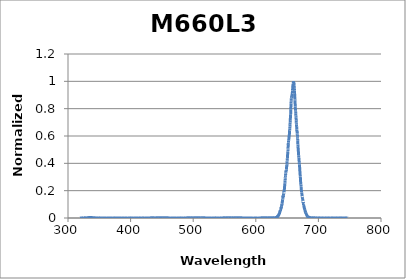
| Category | Normalized Intensity |
|---|---|
| 319.06123499 | 0 |
| 319.17558872 | 0 |
| 319.28993869 | 0 |
| 319.40428493 | 0 |
| 319.51862744 | 0 |
| 319.63296621 | 0 |
| 319.74730126 | 0.001 |
| 319.86163259 | 0 |
| 319.9759602 | 0 |
| 320.09028409 | 0 |
| 320.20460428 | 0 |
| 320.31892077 | 0 |
| 320.43323355 | 0 |
| 320.54754264 | 0 |
| 320.66184804 | 0.001 |
| 320.77614975 | 0 |
| 320.89044778 | 0 |
| 321.00474213 | 0 |
| 321.11903281 | 0 |
| 321.23331982 | 0 |
| 321.34760317 | 0 |
| 321.46188285 | 0 |
| 321.57615889 | 0.001 |
| 321.69043127 | 0 |
| 321.8047 | 0 |
| 321.91896509 | 0 |
| 322.03322655 | 0 |
| 322.14748437 | 0 |
| 322.26173856 | 0 |
| 322.37598913 | 0 |
| 322.49023607 | 0 |
| 322.60447941 | 0 |
| 322.71871913 | 0 |
| 322.83295524 | 0 |
| 322.94718775 | 0 |
| 323.06141667 | 0 |
| 323.17564199 | 0 |
| 323.28986372 | 0 |
| 323.40408187 | 0 |
| 323.51829644 | 0.001 |
| 323.63250743 | 0.001 |
| 323.74671485 | 0 |
| 323.8609187 | 0 |
| 323.97511899 | 0 |
| 324.08931573 | 0 |
| 324.20350891 | 0 |
| 324.31769854 | 0 |
| 324.43188462 | 0 |
| 324.54606717 | 0 |
| 324.66024618 | 0 |
| 324.77442166 | 0 |
| 324.88859361 | 0 |
| 325.00276204 | 0 |
| 325.11692695 | 0 |
| 325.23108834 | 0.001 |
| 325.34524623 | 0 |
| 325.45940061 | 0 |
| 325.5735515 | 0 |
| 325.68769888 | 0 |
| 325.80184278 | 0 |
| 325.91598318 | 0 |
| 326.03012011 | 0.001 |
| 326.14425355 | 0.001 |
| 326.25838353 | 0 |
| 326.37251003 | 0 |
| 326.48663307 | 0 |
| 326.60075264 | 0 |
| 326.71486877 | 0.001 |
| 326.82898144 | 0.001 |
| 326.94309066 | 0 |
| 327.05719644 | 0 |
| 327.17129878 | 0 |
| 327.28539768 | 0 |
| 327.39949316 | 0.001 |
| 327.51358521 | 0 |
| 327.62767384 | 0.001 |
| 327.74175906 | 0 |
| 327.85584086 | 0 |
| 327.96991926 | 0 |
| 328.08399425 | 0.001 |
| 328.19806584 | 0.001 |
| 328.31213404 | 0 |
| 328.42619885 | 0.001 |
| 328.54026028 | 0 |
| 328.65431832 | 0.001 |
| 328.76837299 | 0 |
| 328.88242428 | 0 |
| 328.99647221 | 0.001 |
| 329.11051677 | 0 |
| 329.22455798 | 0 |
| 329.33859583 | 0 |
| 329.45263033 | 0 |
| 329.56666148 | 0 |
| 329.6806893 | 0.001 |
| 329.79471377 | 0 |
| 329.90873492 | 0.001 |
| 330.02275274 | 0.001 |
| 330.13676723 | 0.001 |
| 330.2507784 | 0.002 |
| 330.36478626 | 0.001 |
| 330.47879081 | 0.001 |
| 330.59279206 | 0.002 |
| 330.70679 | 0.001 |
| 330.82078465 | 0 |
| 330.934776 | 0.002 |
| 331.04876407 | 0.001 |
| 331.16274885 | 0.001 |
| 331.27673036 | 0 |
| 331.39070858 | 0.002 |
| 331.50468354 | 0.001 |
| 331.61865523 | 0.001 |
| 331.73262367 | 0.001 |
| 331.84658884 | 0.002 |
| 331.96055076 | 0.001 |
| 332.07450943 | 0.002 |
| 332.18846486 | 0.001 |
| 332.30241705 | 0.002 |
| 332.41636601 | 0.002 |
| 332.53031174 | 0.003 |
| 332.64425423 | 0.002 |
| 332.75819351 | 0.004 |
| 332.87212957 | 0.002 |
| 332.98606242 | 0.003 |
| 333.09999206 | 0.003 |
| 333.21391849 | 0.004 |
| 333.32784173 | 0.004 |
| 333.44176177 | 0.004 |
| 333.55567862 | 0.002 |
| 333.66959229 | 0.003 |
| 333.78350277 | 0.004 |
| 333.89741007 | 0.003 |
| 334.0113142 | 0.002 |
| 334.12521517 | 0.004 |
| 334.23911297 | 0.003 |
| 334.35300761 | 0.004 |
| 334.46689909 | 0.002 |
| 334.58078743 | 0.003 |
| 334.69467261 | 0.003 |
| 334.80855466 | 0.003 |
| 334.92243357 | 0.003 |
| 335.03630934 | 0.003 |
| 335.15018199 | 0.002 |
| 335.26405151 | 0.003 |
| 335.37791791 | 0.003 |
| 335.4917812 | 0.003 |
| 335.60564138 | 0.003 |
| 335.71949845 | 0.003 |
| 335.83335241 | 0.004 |
| 335.94720328 | 0.003 |
| 336.06105106 | 0.002 |
| 336.17489575 | 0.003 |
| 336.28873735 | 0.003 |
| 336.40257588 | 0.004 |
| 336.51641132 | 0.003 |
| 336.6302437 | 0.004 |
| 336.74407301 | 0.003 |
| 336.85789926 | 0.004 |
| 336.97172245 | 0.001 |
| 337.08554259 | 0.003 |
| 337.19935967 | 0.004 |
| 337.31317372 | 0.003 |
| 337.42698472 | 0.001 |
| 337.54079269 | 0.002 |
| 337.65459762 | 0.002 |
| 337.76839953 | 0.003 |
| 337.88219842 | 0.001 |
| 337.99599429 | 0.002 |
| 338.10978714 | 0.002 |
| 338.22357699 | 0.002 |
| 338.33736383 | 0.001 |
| 338.45114767 | 0.002 |
| 338.56492852 | 0.001 |
| 338.67870637 | 0.003 |
| 338.79248124 | 0.001 |
| 338.90625312 | 0.001 |
| 339.02002203 | 0.002 |
| 339.13378796 | 0.001 |
| 339.24755093 | 0.001 |
| 339.36131093 | 0.002 |
| 339.47506796 | 0.001 |
| 339.58882205 | 0.002 |
| 339.70257318 | 0.002 |
| 339.81632136 | 0.002 |
| 339.9300666 | 0.001 |
| 340.0438089 | 0.001 |
| 340.15754827 | 0.001 |
| 340.27128471 | 0.001 |
| 340.38501822 | 0.001 |
| 340.49874882 | 0.001 |
| 340.61247649 | 0.002 |
| 340.72620126 | 0.002 |
| 340.83992312 | 0.002 |
| 340.95364207 | 0.001 |
| 341.06735813 | 0.001 |
| 341.18107129 | 0.001 |
| 341.29478156 | 0 |
| 341.40848895 | 0.002 |
| 341.52219346 | 0.001 |
| 341.63589509 | 0 |
| 341.74959385 | 0 |
| 341.86328974 | 0.001 |
| 341.97698277 | 0.001 |
| 342.09067293 | 0.001 |
| 342.20436025 | 0 |
| 342.31804472 | 0.001 |
| 342.43172634 | 0.001 |
| 342.54540511 | 0.001 |
| 342.65908106 | 0.001 |
| 342.77275417 | 0.001 |
| 342.88642445 | 0 |
| 343.00009191 | 0 |
| 343.11375655 | 0 |
| 343.22741838 | 0.001 |
| 343.34107739 | 0 |
| 343.45473361 | 0.001 |
| 343.56838701 | 0 |
| 343.68203763 | 0 |
| 343.79568545 | 0 |
| 343.90933048 | 0.001 |
| 344.02297273 | 0 |
| 344.1366122 | 0 |
| 344.2502489 | 0 |
| 344.36388283 | 0 |
| 344.47751399 | 0 |
| 344.59114238 | 0 |
| 344.70476803 | 0.001 |
| 344.81839092 | 0.001 |
| 344.93201106 | 0 |
| 345.04562846 | 0.001 |
| 345.15924312 | 0 |
| 345.27285504 | 0 |
| 345.38646424 | 0 |
| 345.5000707 | 0 |
| 345.61367445 | 0 |
| 345.72727548 | 0 |
| 345.8408738 | 0.001 |
| 345.95446941 | 0 |
| 346.06806231 | 0.001 |
| 346.18165252 | 0 |
| 346.29524003 | 0 |
| 346.40882485 | 0.001 |
| 346.52240699 | 0 |
| 346.63598644 | 0 |
| 346.74956322 | 0 |
| 346.86313732 | 0 |
| 346.97670876 | 0 |
| 347.09027753 | 0 |
| 347.20384364 | 0 |
| 347.31740709 | 0 |
| 347.4309679 | 0 |
| 347.54452606 | 0 |
| 347.65808158 | 0 |
| 347.77163446 | 0 |
| 347.88518471 | 0 |
| 347.99873233 | 0 |
| 348.11227732 | 0 |
| 348.2258197 | 0 |
| 348.33935946 | 0 |
| 348.45289661 | 0 |
| 348.56643115 | 0 |
| 348.67996309 | 0 |
| 348.79349244 | 0 |
| 348.90701919 | 0.001 |
| 349.02054335 | 0 |
| 349.13406493 | 0 |
| 349.24758393 | 0 |
| 349.36110035 | 0 |
| 349.4746142 | 0 |
| 349.58812549 | 0 |
| 349.70163421 | 0 |
| 349.81514038 | 0 |
| 349.92864399 | 0 |
| 350.04214506 | 0 |
| 350.15564358 | 0 |
| 350.26913955 | 0.001 |
| 350.382633 | 0 |
| 350.49612391 | 0 |
| 350.6096123 | 0 |
| 350.72309816 | 0.001 |
| 350.83658151 | 0.001 |
| 350.95006234 | 0 |
| 351.06354066 | 0 |
| 351.17701648 | 0 |
| 351.2904898 | 0 |
| 351.40396063 | 0 |
| 351.51742896 | 0 |
| 351.6308948 | 0 |
| 351.74435817 | 0 |
| 351.85781905 | 0 |
| 351.97127746 | 0 |
| 352.08473341 | 0 |
| 352.19818688 | 0 |
| 352.3116379 | 0 |
| 352.42508646 | 0 |
| 352.53853257 | 0 |
| 352.65197624 | 0 |
| 352.76541746 | 0.001 |
| 352.87885624 | 0 |
| 352.99229259 | 0 |
| 353.10572651 | 0 |
| 353.219158 | 0 |
| 353.33258707 | 0 |
| 353.44601373 | 0 |
| 353.55943798 | 0 |
| 353.67285982 | 0 |
| 353.78627925 | 0 |
| 353.89969629 | 0 |
| 354.01311094 | 0 |
| 354.12652319 | 0 |
| 354.23993306 | 0 |
| 354.35334055 | 0 |
| 354.46674566 | 0 |
| 354.58014841 | 0 |
| 354.69354878 | 0 |
| 354.80694679 | 0 |
| 354.92034244 | 0 |
| 355.03373574 | 0 |
| 355.14712669 | 0 |
| 355.26051529 | 0 |
| 355.37390156 | 0 |
| 355.48728548 | 0 |
| 355.60066708 | 0 |
| 355.71404635 | 0 |
| 355.82742329 | 0 |
| 355.94079791 | 0 |
| 356.05417023 | 0 |
| 356.16754023 | 0 |
| 356.28090792 | 0 |
| 356.39427332 | 0 |
| 356.50763642 | 0 |
| 356.62099722 | 0 |
| 356.73435574 | 0 |
| 356.84771198 | 0 |
| 356.96106594 | 0 |
| 357.07441762 | 0 |
| 357.18776703 | 0 |
| 357.30111418 | 0 |
| 357.41445906 | 0 |
| 357.52780169 | 0 |
| 357.64114207 | 0 |
| 357.7544802 | 0.001 |
| 357.86781609 | 0 |
| 357.98114973 | 0 |
| 358.09448114 | 0 |
| 358.20781033 | 0 |
| 358.32113728 | 0 |
| 358.43446202 | 0 |
| 358.54778454 | 0 |
| 358.66110484 | 0.001 |
| 358.77442294 | 0 |
| 358.88773884 | 0 |
| 359.00105253 | 0 |
| 359.11436403 | 0 |
| 359.22767334 | 0 |
| 359.34098047 | 0 |
| 359.45428541 | 0 |
| 359.56758818 | 0 |
| 359.68088877 | 0 |
| 359.79418719 | 0 |
| 359.90748346 | 0 |
| 360.02077756 | 0 |
| 360.13406951 | 0 |
| 360.2473593 | 0.001 |
| 360.36064695 | 0 |
| 360.47393246 | 0 |
| 360.58721584 | 0 |
| 360.70049708 | 0 |
| 360.81377619 | 0 |
| 360.92705317 | 0 |
| 361.04032804 | 0 |
| 361.1536008 | 0.001 |
| 361.26687144 | 0 |
| 361.38013997 | 0 |
| 361.49340641 | 0 |
| 361.60667075 | 0 |
| 361.71993299 | 0 |
| 361.83319314 | 0 |
| 361.94645122 | 0 |
| 362.05970721 | 0.001 |
| 362.17296113 | 0 |
| 362.28621297 | 0 |
| 362.39946275 | 0 |
| 362.51271047 | 0 |
| 362.62595613 | 0 |
| 362.73919974 | 0 |
| 362.85244129 | 0 |
| 362.96568081 | 0 |
| 363.07891828 | 0 |
| 363.19215372 | 0 |
| 363.30538713 | 0 |
| 363.41861851 | 0.001 |
| 363.53184787 | 0 |
| 363.64507521 | 0 |
| 363.75830054 | 0 |
| 363.87152386 | 0 |
| 363.98474518 | 0 |
| 364.09796449 | 0 |
| 364.21118182 | 0 |
| 364.32439714 | 0 |
| 364.43761049 | 0 |
| 364.55082185 | 0.001 |
| 364.66403123 | 0 |
| 364.77723864 | 0 |
| 364.89044408 | 0 |
| 365.00364755 | 0 |
| 365.11684907 | 0 |
| 365.23004863 | 0 |
| 365.34324624 | 0 |
| 365.4564419 | 0 |
| 365.56963562 | 0 |
| 365.6828274 | 0 |
| 365.79601725 | 0 |
| 365.90920516 | 0 |
| 366.02239116 | 0.001 |
| 366.13557523 | 0 |
| 366.24875739 | 0 |
| 366.36193764 | 0 |
| 366.47511598 | 0 |
| 366.58829241 | 0 |
| 366.70146695 | 0 |
| 366.8146396 | 0 |
| 366.92781035 | 0 |
| 367.04097922 | 0.001 |
| 367.15414621 | 0 |
| 367.26731133 | 0 |
| 367.38047457 | 0 |
| 367.49363594 | 0 |
| 367.60679546 | 0 |
| 367.71995311 | 0 |
| 367.83310891 | 0 |
| 367.94626286 | 0 |
| 368.05941497 | 0 |
| 368.17256523 | 0.001 |
| 368.28571366 | 0 |
| 368.39886026 | 0 |
| 368.51200503 | 0 |
| 368.62514798 | 0 |
| 368.73828911 | 0 |
| 368.85142842 | 0.001 |
| 368.96456593 | 0 |
| 369.07770163 | 0 |
| 369.19083553 | 0 |
| 369.30396763 | 0 |
| 369.41709794 | 0 |
| 369.53022646 | 0 |
| 369.6433532 | 0.001 |
| 369.75647817 | 0 |
| 369.86960135 | 0 |
| 369.98272277 | 0 |
| 370.09584242 | 0 |
| 370.20896031 | 0 |
| 370.32207645 | 0 |
| 370.43519083 | 0 |
| 370.54830347 | 0.001 |
| 370.66141436 | 0 |
| 370.77452351 | 0 |
| 370.88763093 | 0 |
| 371.00073662 | 0 |
| 371.11384058 | 0 |
| 371.22694283 | 0 |
| 371.34004335 | 0 |
| 371.45314216 | 0 |
| 371.56623927 | 0 |
| 371.67933467 | 0 |
| 371.79242838 | 0 |
| 371.90552038 | 0 |
| 372.0186107 | 0 |
| 372.13169934 | 0 |
| 372.24478629 | 0.001 |
| 372.35787156 | 0 |
| 372.47095516 | 0.001 |
| 372.5840371 | 0 |
| 372.69711737 | 0.001 |
| 372.81019598 | 0 |
| 372.92327294 | 0 |
| 373.03634824 | 0 |
| 373.14942191 | 0 |
| 373.26249392 | 0 |
| 373.37556431 | 0 |
| 373.48863306 | 0 |
| 373.60170018 | 0 |
| 373.71476568 | 0 |
| 373.82782956 | 0 |
| 373.94089182 | 0 |
| 374.05395247 | 0 |
| 374.16701152 | 0 |
| 374.28006897 | 0 |
| 374.39312481 | 0 |
| 374.50617907 | 0.001 |
| 374.61923174 | 0 |
| 374.73228282 | 0 |
| 374.84533233 | 0 |
| 374.95838025 | 0 |
| 375.07142661 | 0 |
| 375.18447141 | 0 |
| 375.29751464 | 0 |
| 375.41055631 | 0 |
| 375.52359643 | 0 |
| 375.636635 | 0 |
| 375.74967203 | 0 |
| 375.86270752 | 0 |
| 375.97574147 | 0 |
| 376.08877389 | 0 |
| 376.20180479 | 0 |
| 376.31483416 | 0 |
| 376.42786202 | 0 |
| 376.54088836 | 0 |
| 376.6539132 | 0 |
| 376.76693653 | 0 |
| 376.87995836 | 0 |
| 376.9929787 | 0 |
| 377.10599754 | 0 |
| 377.2190149 | 0 |
| 377.33203077 | 0 |
| 377.44504517 | 0 |
| 377.5580581 | 0 |
| 377.67106955 | 0 |
| 377.78407955 | 0 |
| 377.89708808 | 0.001 |
| 378.01009516 | 0 |
| 378.12310078 | 0 |
| 378.23610496 | 0 |
| 378.3491077 | 0.001 |
| 378.46210899 | 0 |
| 378.57510886 | 0 |
| 378.6881073 | 0 |
| 378.80110431 | 0 |
| 378.9140999 | 0 |
| 379.02709408 | 0 |
| 379.14008684 | 0 |
| 379.2530782 | 0 |
| 379.36606815 | 0 |
| 379.47905671 | 0 |
| 379.59204388 | 0 |
| 379.70502965 | 0 |
| 379.81801404 | 0 |
| 379.93099705 | 0 |
| 380.04397868 | 0 |
| 380.15695895 | 0 |
| 380.26993784 | 0 |
| 380.38291538 | 0 |
| 380.49589155 | 0 |
| 380.60886637 | 0 |
| 380.72183984 | 0 |
| 380.83481197 | 0 |
| 380.94778276 | 0 |
| 381.06075221 | 0 |
| 381.17372033 | 0 |
| 381.28668712 | 0 |
| 381.39965259 | 0 |
| 381.51261674 | 0.001 |
| 381.62557958 | 0 |
| 381.7385411 | 0 |
| 381.85150133 | 0 |
| 381.96446025 | 0 |
| 382.07741787 | 0 |
| 382.19037421 | 0 |
| 382.30332925 | 0 |
| 382.41628302 | 0 |
| 382.5292355 | 0 |
| 382.64218671 | 0 |
| 382.75513666 | 0 |
| 382.86808533 | 0 |
| 382.98103275 | 0.001 |
| 383.09397891 | 0 |
| 383.20692381 | 0 |
| 383.31986747 | 0 |
| 383.43280989 | 0 |
| 383.54575107 | 0 |
| 383.65869101 | 0 |
| 383.77162973 | 0 |
| 383.88456722 | 0 |
| 383.99750348 | 0.001 |
| 384.11043854 | 0 |
| 384.22337237 | 0 |
| 384.33630501 | 0.001 |
| 384.44923643 | 0 |
| 384.56216666 | 0 |
| 384.6750957 | 0 |
| 384.78802354 | 0 |
| 384.9009502 | 0 |
| 385.01387568 | 0 |
| 385.12679999 | 0 |
| 385.23972311 | 0 |
| 385.35264508 | 0 |
| 385.46556588 | 0 |
| 385.57848551 | 0 |
| 385.691404 | 0 |
| 385.80432133 | 0 |
| 385.91723752 | 0 |
| 386.03015257 | 0 |
| 386.14306648 | 0 |
| 386.25597926 | 0 |
| 386.36889091 | 0 |
| 386.48180144 | 0 |
| 386.59471085 | 0 |
| 386.70761914 | 0 |
| 386.82052633 | 0.001 |
| 386.9334324 | 0 |
| 387.04633738 | 0 |
| 387.15924126 | 0 |
| 387.27214404 | 0 |
| 387.38504574 | 0 |
| 387.49794636 | 0 |
| 387.61084589 | 0 |
| 387.72374435 | 0 |
| 387.83664174 | 0 |
| 387.94953807 | 0 |
| 388.06243333 | 0 |
| 388.17532753 | 0 |
| 388.28822068 | 0 |
| 388.40111279 | 0 |
| 388.51400385 | 0 |
| 388.62689387 | 0 |
| 388.73978286 | 0 |
| 388.85267081 | 0 |
| 388.96555774 | 0 |
| 389.07844365 | 0 |
| 389.19132854 | 0 |
| 389.30421241 | 0 |
| 389.41709528 | 0 |
| 389.52997715 | 0 |
| 389.64285801 | 0 |
| 389.75573788 | 0 |
| 389.86861676 | 0 |
| 389.98149465 | 0 |
| 390.09437156 | 0 |
| 390.2072475 | 0 |
| 390.32012246 | 0 |
| 390.43299645 | 0 |
| 390.54586948 | 0 |
| 390.65874154 | 0 |
| 390.77161265 | 0 |
| 390.88448282 | 0 |
| 390.99735203 | 0 |
| 391.1102203 | 0 |
| 391.22308764 | 0 |
| 391.33595404 | 0 |
| 391.44881951 | 0 |
| 391.56168406 | 0 |
| 391.67454769 | 0 |
| 391.7874104 | 0 |
| 391.9002722 | 0 |
| 392.0131331 | 0 |
| 392.12599309 | 0 |
| 392.23885219 | 0 |
| 392.35171039 | 0 |
| 392.4645677 | 0 |
| 392.57742413 | 0 |
| 392.69027968 | 0 |
| 392.80313435 | 0 |
| 392.91598815 | 0 |
| 393.02884109 | 0 |
| 393.14169316 | 0 |
| 393.25454437 | 0 |
| 393.36739473 | 0 |
| 393.48024425 | 0 |
| 393.59309291 | 0 |
| 393.70594074 | 0 |
| 393.81878773 | 0 |
| 393.93163389 | 0 |
| 394.04447922 | 0 |
| 394.15732373 | 0 |
| 394.27016742 | 0 |
| 394.3830103 | 0 |
| 394.49585237 | 0 |
| 394.60869363 | 0 |
| 394.7215341 | 0 |
| 394.83437376 | 0.001 |
| 394.94721264 | 0 |
| 395.06005073 | 0 |
| 395.17288803 | 0 |
| 395.28572456 | 0 |
| 395.39856031 | 0 |
| 395.5113953 | 0 |
| 395.62422952 | 0 |
| 395.73706297 | 0 |
| 395.84989568 | 0 |
| 395.96272763 | 0 |
| 396.07555883 | 0 |
| 396.18838929 | 0 |
| 396.30121901 | 0 |
| 396.414048 | 0 |
| 396.52687626 | 0 |
| 396.63970379 | 0 |
| 396.7525306 | 0 |
| 396.8653567 | 0 |
| 396.97818208 | 0 |
| 397.09100676 | 0 |
| 397.20383073 | 0 |
| 397.31665401 | 0 |
| 397.42947659 | 0 |
| 397.54229848 | 0 |
| 397.65511969 | 0 |
| 397.76794021 | 0 |
| 397.88076006 | 0 |
| 397.99357923 | 0 |
| 398.10639774 | 0 |
| 398.21921559 | 0 |
| 398.33203277 | 0 |
| 398.44484931 | 0 |
| 398.55766519 | 0 |
| 398.67048042 | 0 |
| 398.78329502 | 0 |
| 398.89610898 | 0 |
| 399.0089223 | 0 |
| 399.121735 | 0 |
| 399.23454708 | 0 |
| 399.34735853 | 0.001 |
| 399.46016938 | 0 |
| 399.57297961 | 0 |
| 399.68578923 | 0 |
| 399.79859826 | 0 |
| 399.91140669 | 0 |
| 400.02421452 | 0.001 |
| 400.13702177 | 0 |
| 400.24982843 | 0 |
| 400.36263452 | 0 |
| 400.47544003 | 0 |
| 400.58824497 | 0 |
| 400.70104934 | 0 |
| 400.81385315 | 0 |
| 400.92665641 | 0 |
| 401.03945911 | 0 |
| 401.15226127 | 0 |
| 401.26506288 | 0 |
| 401.37786395 | 0.001 |
| 401.49066449 | 0 |
| 401.60346449 | 0 |
| 401.71626397 | 0 |
| 401.82906293 | 0 |
| 401.94186137 | 0 |
| 402.0546593 | 0 |
| 402.16745672 | 0 |
| 402.28025364 | 0 |
| 402.39305006 | 0 |
| 402.50584598 | 0 |
| 402.61864141 | 0 |
| 402.73143636 | 0 |
| 402.84423082 | 0.001 |
| 402.95702481 | 0 |
| 403.06981832 | 0 |
| 403.18261137 | 0 |
| 403.29540395 | 0 |
| 403.40819607 | 0 |
| 403.52098774 | 0 |
| 403.63377895 | 0 |
| 403.74656972 | 0 |
| 403.85936005 | 0 |
| 403.97214994 | 0 |
| 404.0849394 | 0 |
| 404.19772842 | 0 |
| 404.31051703 | 0 |
| 404.42330521 | 0 |
| 404.53609298 | 0 |
| 404.64888034 | 0 |
| 404.76166729 | 0 |
| 404.87445384 | 0 |
| 404.98723999 | 0 |
| 405.10002575 | 0 |
| 405.21281112 | 0 |
| 405.3255961 | 0 |
| 405.43838071 | 0 |
| 405.55116494 | 0 |
| 405.6639488 | 0 |
| 405.77673229 | 0 |
| 405.88951542 | 0 |
| 406.00229819 | 0 |
| 406.11508061 | 0.001 |
| 406.22786268 | 0 |
| 406.34064441 | 0 |
| 406.45342579 | 0 |
| 406.56620684 | 0 |
| 406.67898756 | 0 |
| 406.79176795 | 0 |
| 406.90454802 | 0 |
| 407.01732777 | 0 |
| 407.13010721 | 0 |
| 407.24288633 | 0 |
| 407.35566516 | 0 |
| 407.46844368 | 0 |
| 407.58122191 | 0 |
| 407.69399984 | 0 |
| 407.80677749 | 0 |
| 407.91955486 | 0 |
| 408.03233195 | 0 |
| 408.14510876 | 0 |
| 408.25788531 | 0 |
| 408.37066159 | 0 |
| 408.48343761 | 0.001 |
| 408.59621337 | 0 |
| 408.70898888 | 0 |
| 408.82176415 | 0 |
| 408.93453917 | 0 |
| 409.04731396 | 0 |
| 409.16008851 | 0 |
| 409.27286283 | 0 |
| 409.38563692 | 0 |
| 409.4984108 | 0 |
| 409.61118446 | 0 |
| 409.7239579 | 0 |
| 409.83673114 | 0 |
| 409.94950418 | 0.001 |
| 410.06227702 | 0 |
| 410.17504966 | 0 |
| 410.28782212 | 0 |
| 410.40059439 | 0.001 |
| 410.51336648 | 0 |
| 410.62613839 | 0 |
| 410.73891013 | 0 |
| 410.85168171 | 0 |
| 410.96445312 | 0 |
| 411.07722437 | 0 |
| 411.18999546 | 0 |
| 411.30276641 | 0 |
| 411.41553721 | 0 |
| 411.52830788 | 0.001 |
| 411.6410784 | 0 |
| 411.75384879 | 0 |
| 411.86661906 | 0 |
| 411.9793892 | 0 |
| 412.09215922 | 0 |
| 412.20492913 | 0 |
| 412.31769893 | 0 |
| 412.43046862 | 0 |
| 412.54323822 | 0 |
| 412.65600771 | 0 |
| 412.76877711 | 0 |
| 412.88154643 | 0 |
| 412.99431566 | 0 |
| 413.10708482 | 0 |
| 413.21985389 | 0 |
| 413.3326229 | 0.001 |
| 413.44539184 | 0 |
| 413.55816073 | 0.001 |
| 413.67092955 | 0 |
| 413.78369832 | 0 |
| 413.89646705 | 0 |
| 414.00923573 | 0 |
| 414.12200437 | 0 |
| 414.23477298 | 0 |
| 414.34754155 | 0 |
| 414.4603101 | 0.001 |
| 414.57307863 | 0 |
| 414.68584715 | 0 |
| 414.79861565 | 0 |
| 414.91138414 | 0 |
| 415.02415263 | 0 |
| 415.13692111 | 0 |
| 415.24968961 | 0 |
| 415.36245811 | 0 |
| 415.47522663 | 0 |
| 415.58799516 | 0 |
| 415.70076372 | 0 |
| 415.81353231 | 0 |
| 415.92630093 | 0 |
| 416.03906958 | 0 |
| 416.15183828 | 0 |
| 416.26460701 | 0 |
| 416.3773758 | 0 |
| 416.49014465 | 0 |
| 416.60291355 | 0 |
| 416.71568251 | 0 |
| 416.82845154 | 0 |
| 416.94122064 | 0 |
| 417.05398982 | 0 |
| 417.16675908 | 0 |
| 417.27952842 | 0 |
| 417.39229785 | 0 |
| 417.50506738 | 0 |
| 417.617837 | 0.001 |
| 417.73060673 | 0 |
| 417.84337657 | 0 |
| 417.95614651 | 0 |
| 418.06891657 | 0 |
| 418.18168675 | 0 |
| 418.29445706 | 0 |
| 418.40722749 | 0 |
| 418.51999806 | 0.001 |
| 418.63276877 | 0 |
| 418.74553962 | 0 |
| 418.85831061 | 0 |
| 418.97108176 | 0 |
| 419.08385306 | 0 |
| 419.19662452 | 0 |
| 419.30939615 | 0 |
| 419.42216794 | 0 |
| 419.53493991 | 0 |
| 419.64771206 | 0 |
| 419.76048439 | 0 |
| 419.8732569 | 0 |
| 419.98602961 | 0.001 |
| 420.09880251 | 0 |
| 420.21157562 | 0 |
| 420.32434892 | 0.001 |
| 420.43712244 | 0 |
| 420.54989616 | 0 |
| 420.66267011 | 0 |
| 420.77544428 | 0 |
| 420.88821867 | 0 |
| 421.0009933 | 0 |
| 421.11376816 | 0 |
| 421.22654326 | 0.001 |
| 421.3393186 | 0 |
| 421.4520942 | 0 |
| 421.56487004 | 0 |
| 421.67764614 | 0 |
| 421.79042251 | 0 |
| 421.90319914 | 0 |
| 422.01597604 | 0 |
| 422.12875322 | 0 |
| 422.24153068 | 0 |
| 422.35430842 | 0 |
| 422.46708645 | 0 |
| 422.57986477 | 0 |
| 422.69264339 | 0 |
| 422.80542231 | 0 |
| 422.91820154 | 0 |
| 423.03098108 | 0 |
| 423.14376093 | 0 |
| 423.2565411 | 0 |
| 423.3693216 | 0 |
| 423.48210242 | 0 |
| 423.59488358 | 0 |
| 423.70766507 | 0 |
| 423.82044691 | 0 |
| 423.93322909 | 0 |
| 424.04601162 | 0 |
| 424.15879451 | 0.001 |
| 424.27157775 | 0 |
| 424.38436136 | 0 |
| 424.49714534 | 0 |
| 424.60992969 | 0 |
| 424.72271442 | 0 |
| 424.83549953 | 0.001 |
| 424.94828502 | 0 |
| 425.06107091 | 0 |
| 425.17385719 | 0 |
| 425.28664386 | 0 |
| 425.39943095 | 0 |
| 425.51221844 | 0 |
| 425.62500634 | 0 |
| 425.73779466 | 0 |
| 425.8505834 | 0 |
| 425.96337256 | 0 |
| 426.07616216 | 0 |
| 426.18895219 | 0 |
| 426.30174266 | 0 |
| 426.41453357 | 0 |
| 426.52732493 | 0 |
| 426.64011674 | 0 |
| 426.75290901 | 0 |
| 426.86570174 | 0.001 |
| 426.97849494 | 0 |
| 427.0912886 | 0 |
| 427.20408274 | 0 |
| 427.31687736 | 0 |
| 427.42967246 | 0 |
| 427.54246805 | 0 |
| 427.65526413 | 0 |
| 427.76806071 | 0 |
| 427.88085779 | 0 |
| 427.99365537 | 0 |
| 428.10645347 | 0 |
| 428.21925207 | 0 |
| 428.3320512 | 0 |
| 428.44485085 | 0.001 |
| 428.55765103 | 0 |
| 428.67045174 | 0 |
| 428.78325298 | 0 |
| 428.89605477 | 0 |
| 429.0088571 | 0 |
| 429.12165998 | 0 |
| 429.23446341 | 0 |
| 429.34726741 | 0 |
| 429.46007196 | 0 |
| 429.57287708 | 0 |
| 429.68568278 | 0 |
| 429.79848905 | 0 |
| 429.9112959 | 0 |
| 430.02410334 | 0 |
| 430.13691136 | 0 |
| 430.24971998 | 0 |
| 430.3625292 | 0 |
| 430.47533902 | 0 |
| 430.58814945 | 0 |
| 430.70096049 | 0 |
| 430.81377214 | 0 |
| 430.92658442 | 0 |
| 431.03939732 | 0 |
| 431.15221085 | 0 |
| 431.26502501 | 0 |
| 431.37783981 | 0 |
| 431.49065526 | 0.002 |
| 431.60347135 | 0 |
| 431.71628809 | 0.001 |
| 431.82910549 | 0 |
| 431.94192355 | 0.001 |
| 432.05474227 | 0 |
| 432.16756166 | 0.002 |
| 432.28038173 | 0 |
| 432.39320247 | 0.002 |
| 432.50602389 | 0 |
| 432.61884601 | 0.001 |
| 432.73166881 | 0 |
| 432.84449231 | 0.001 |
| 432.95731651 | 0 |
| 433.07014141 | 0.001 |
| 433.18296703 | 0 |
| 433.29579335 | 0.001 |
| 433.4086204 | 0 |
| 433.52144816 | 0.001 |
| 433.63427665 | 0 |
| 433.74710588 | 0.002 |
| 433.85993584 | 0 |
| 433.97276654 | 0.001 |
| 434.08559798 | 0 |
| 434.19843017 | 0.002 |
| 434.31126312 | 0 |
| 434.42409682 | 0.001 |
| 434.53693129 | 0 |
| 434.64976652 | 0.001 |
| 434.76260252 | 0 |
| 434.8754393 | 0.001 |
| 434.98827685 | 0 |
| 435.1011152 | 0.002 |
| 435.21395433 | 0 |
| 435.32679425 | 0.002 |
| 435.43963497 | 0 |
| 435.55247649 | 0.001 |
| 435.66531882 | 0 |
| 435.77816196 | 0.001 |
| 435.89100591 | 0 |
| 436.00385069 | 0.001 |
| 436.11669629 | 0 |
| 436.22954271 | 0.001 |
| 436.34238997 | 0 |
| 436.45523807 | 0.001 |
| 436.56808701 | 0 |
| 436.68093679 | 0.001 |
| 436.79378743 | 0 |
| 436.90663892 | 0.001 |
| 437.01949126 | 0 |
| 437.13234448 | 0 |
| 437.24519856 | 0 |
| 437.35805351 | 0.001 |
| 437.47090934 | 0 |
| 437.58376606 | 0.001 |
| 437.69662366 | 0 |
| 437.80948215 | 0.002 |
| 437.92234153 | 0 |
| 438.03520181 | 0.002 |
| 438.148063 | 0 |
| 438.26092509 | 0.002 |
| 438.3737881 | 0 |
| 438.48665203 | 0.002 |
| 438.59951687 | 0 |
| 438.71238264 | 0.001 |
| 438.82524934 | 0 |
| 438.93811698 | 0 |
| 439.05098556 | 0 |
| 439.16385508 | 0 |
| 439.27672554 | 0 |
| 439.38959696 | 0.001 |
| 439.50246934 | 0 |
| 439.61534268 | 0.001 |
| 439.72821698 | 0 |
| 439.84109225 | 0.001 |
| 439.9539685 | 0 |
| 440.06684572 | 0.002 |
| 440.17972393 | 0 |
| 440.29260313 | 0.002 |
| 440.40548332 | 0 |
| 440.51836451 | 0.002 |
| 440.6312467 | 0 |
| 440.74412989 | 0.002 |
| 440.85701409 | 0 |
| 440.96989931 | 0 |
| 441.08278554 | 0 |
| 441.1956728 | 0.002 |
| 441.30856109 | 0 |
| 441.42145041 | 0 |
| 441.53434076 | 0 |
| 441.64723216 | 0.001 |
| 441.7601246 | 0 |
| 441.87301809 | 0.002 |
| 441.98591264 | 0 |
| 442.09880824 | 0 |
| 442.21170491 | 0 |
| 442.32460264 | 0 |
| 442.43750145 | 0 |
| 442.55040133 | 0.002 |
| 442.66330229 | 0 |
| 442.77620434 | 0.002 |
| 442.88910748 | 0 |
| 443.00201171 | 0.002 |
| 443.11491704 | 0 |
| 443.22782347 | 0.002 |
| 443.34073101 | 0 |
| 443.45363966 | 0.001 |
| 443.56654943 | 0 |
| 443.67946032 | 0.001 |
| 443.79237233 | 0 |
| 443.90528548 | 0.001 |
| 444.01819975 | 0 |
| 444.13111517 | 0.001 |
| 444.24403173 | 0 |
| 444.35694943 | 0.002 |
| 444.46986829 | 0 |
| 444.5827883 | 0.001 |
| 444.69570947 | 0 |
| 444.80863181 | 0.002 |
| 444.92155532 | 0 |
| 445.03448 | 0.002 |
| 445.14740586 | 0 |
| 445.2603329 | 0.001 |
| 445.37326113 | 0 |
| 445.48619054 | 0.001 |
| 445.59912116 | 0 |
| 445.71205298 | 0.001 |
| 445.824986 | 0 |
| 445.93792022 | 0.001 |
| 446.05085567 | 0 |
| 446.16379233 | 0.001 |
| 446.27673021 | 0 |
| 446.38966932 | 0.002 |
| 446.50260966 | 0 |
| 446.61555124 | 0.001 |
| 446.72849405 | 0 |
| 446.84143812 | 0.002 |
| 446.95438343 | 0 |
| 447.06732999 | 0.002 |
| 447.18027781 | 0 |
| 447.29322689 | 0.002 |
| 447.40617724 | 0 |
| 447.51912886 | 0.001 |
| 447.63208176 | 0 |
| 447.74503594 | 0.002 |
| 447.8579914 | 0 |
| 447.97094815 | 0.002 |
| 448.08390619 | 0 |
| 448.19686553 | 0.002 |
| 448.30982617 | 0 |
| 448.42278812 | 0.001 |
| 448.53575138 | 0 |
| 448.64871596 | 0.002 |
| 448.76168185 | 0 |
| 448.87464907 | 0.001 |
| 448.98761762 | 0 |
| 449.1005875 | 0.001 |
| 449.21355871 | 0 |
| 449.32653127 | 0.002 |
| 449.43950518 | 0 |
| 449.55248044 | 0.001 |
| 449.66545705 | 0 |
| 449.77843502 | 0.003 |
| 449.89141436 | 0 |
| 450.00439506 | 0.002 |
| 450.11737714 | 0 |
| 450.23036059 | 0 |
| 450.34334543 | 0 |
| 450.45633165 | 0.002 |
| 450.56931926 | 0 |
| 450.68230827 | 0.001 |
| 450.79529867 | 0 |
| 450.90829048 | 0.001 |
| 451.0212837 | 0 |
| 451.13427833 | 0.001 |
| 451.24727438 | 0 |
| 451.36027185 | 0.001 |
| 451.47327075 | 0 |
| 451.58627108 | 0.002 |
| 451.69927284 | 0 |
| 451.81227604 | 0.001 |
| 451.92528068 | 0 |
| 452.03828677 | 0.001 |
| 452.15129432 | 0 |
| 452.26430332 | 0.001 |
| 452.37731378 | 0 |
| 452.49032571 | 0.002 |
| 452.60333911 | 0 |
| 452.71635398 | 0.002 |
| 452.82937034 | 0 |
| 452.94238817 | 0.001 |
| 453.0554075 | 0 |
| 453.16842832 | 0.001 |
| 453.28145063 | 0 |
| 453.39447444 | 0.001 |
| 453.50749976 | 0 |
| 453.62052659 | 0 |
| 453.73355494 | 0 |
| 453.8465848 | 0.001 |
| 453.95961619 | 0 |
| 454.0726491 | 0.001 |
| 454.18568355 | 0 |
| 454.29871953 | 0.002 |
| 454.41175706 | 0 |
| 454.52479613 | 0.002 |
| 454.63783675 | 0 |
| 454.75087892 | 0 |
| 454.86392266 | 0 |
| 454.97696795 | 0.001 |
| 455.09001482 | 0 |
| 455.20306325 | 0.001 |
| 455.31611327 | 0 |
| 455.42916486 | 0 |
| 455.54221804 | 0 |
| 455.65527281 | 0.001 |
| 455.76832917 | 0 |
| 455.88138713 | 0.001 |
| 455.99444669 | 0 |
| 456.10750787 | 0.002 |
| 456.22057065 | 0 |
| 456.33363505 | 0.001 |
| 456.44670107 | 0 |
| 456.55976871 | 0.002 |
| 456.67283799 | 0 |
| 456.7859089 | 0.002 |
| 456.89898145 | 0 |
| 457.01205564 | 0.002 |
| 457.12513147 | 0 |
| 457.23820896 | 0.001 |
| 457.35128811 | 0 |
| 457.46436892 | 0.001 |
| 457.57745139 | 0 |
| 457.69053553 | 0.001 |
| 457.80362134 | 0 |
| 457.91670883 | 0.001 |
| 458.02979801 | 0 |
| 458.14288887 | 0.001 |
| 458.25598142 | 0 |
| 458.36907567 | 0.001 |
| 458.48217162 | 0 |
| 458.59526928 | 0.001 |
| 458.70836864 | 0 |
| 458.82146972 | 0.002 |
| 458.93457252 | 0 |
| 459.04767704 | 0.001 |
| 459.16078328 | 0 |
| 459.27389126 | 0.001 |
| 459.38700097 | 0 |
| 459.50011242 | 0.001 |
| 459.61322562 | 0 |
| 459.72634057 | 0.001 |
| 459.83945727 | 0 |
| 459.95257573 | 0.001 |
| 460.06569595 | 0 |
| 460.17881793 | 0.001 |
| 460.29194169 | 0 |
| 460.40506723 | 0 |
| 460.51819454 | 0 |
| 460.63132364 | 0 |
| 460.74445453 | 0 |
| 460.85758721 | 0 |
| 460.97072169 | 0 |
| 461.08385797 | 0 |
| 461.19699605 | 0 |
| 461.31013595 | 0 |
| 461.42327767 | 0 |
| 461.5364212 | 0 |
| 461.64956656 | 0 |
| 461.76271375 | 0 |
| 461.87586277 | 0 |
| 461.98901362 | 0 |
| 462.10216632 | 0 |
| 462.21532087 | 0 |
| 462.32847727 | 0 |
| 462.44163552 | 0 |
| 462.55479563 | 0 |
| 462.66795761 | 0 |
| 462.78112145 | 0 |
| 462.89428717 | 0 |
| 463.00745477 | 0 |
| 463.12062424 | 0 |
| 463.23379561 | 0 |
| 463.34696886 | 0 |
| 463.46014401 | 0 |
| 463.57332106 | 0 |
| 463.68650001 | 0 |
| 463.79968087 | 0 |
| 463.91286365 | 0 |
| 464.02604834 | 0 |
| 464.13923495 | 0 |
| 464.25242349 | 0 |
| 464.36561396 | 0 |
| 464.47880637 | 0 |
| 464.59200071 | 0 |
| 464.705197 | 0 |
| 464.81839523 | 0 |
| 464.93159542 | 0 |
| 465.04479757 | 0 |
| 465.15800168 | 0 |
| 465.27120775 | 0 |
| 465.38441579 | 0 |
| 465.49762581 | 0 |
| 465.61083781 | 0 |
| 465.72405179 | 0 |
| 465.83726776 | 0 |
| 465.95048572 | 0 |
| 466.06370568 | 0 |
| 466.17692764 | 0 |
| 466.29015161 | 0 |
| 466.40337759 | 0 |
| 466.51660558 | 0 |
| 466.62983559 | 0 |
| 466.74306762 | 0 |
| 466.85630169 | 0 |
| 466.96953778 | 0 |
| 467.08277591 | 0 |
| 467.19601608 | 0 |
| 467.3092583 | 0 |
| 467.42250257 | 0 |
| 467.53574889 | 0 |
| 467.64899727 | 0 |
| 467.76224772 | 0 |
| 467.87550023 | 0 |
| 467.98875481 | 0 |
| 468.10201148 | 0 |
| 468.21527022 | 0.001 |
| 468.32853105 | 0 |
| 468.44179396 | 0 |
| 468.55505897 | 0 |
| 468.66832609 | 0 |
| 468.7815953 | 0 |
| 468.89486662 | 0 |
| 469.00814005 | 0 |
| 469.1214156 | 0 |
| 469.23469328 | 0 |
| 469.34797307 | 0 |
| 469.461255 | 0 |
| 469.57453906 | 0 |
| 469.68782526 | 0 |
| 469.8011136 | 0 |
| 469.91440409 | 0 |
| 470.02769673 | 0 |
| 470.14099153 | 0 |
| 470.25428848 | 0 |
| 470.36758761 | 0 |
| 470.4808889 | 0 |
| 470.59419237 | 0 |
| 470.70749801 | 0 |
| 470.82080584 | 0 |
| 470.93411585 | 0 |
| 471.04742806 | 0 |
| 471.16074246 | 0 |
| 471.27405907 | 0 |
| 471.38737788 | 0 |
| 471.50069889 | 0 |
| 471.61402213 | 0 |
| 471.72734758 | 0 |
| 471.84067525 | 0 |
| 471.95400515 | 0 |
| 472.06733728 | 0 |
| 472.18067165 | 0 |
| 472.29400826 | 0 |
| 472.40734711 | 0 |
| 472.52068821 | 0.001 |
| 472.63403157 | 0 |
| 472.74737718 | 0 |
| 472.86072506 | 0 |
| 472.9740752 | 0.001 |
| 473.08742761 | 0 |
| 473.2007823 | 0 |
| 473.31413927 | 0 |
| 473.42749853 | 0 |
| 473.54086007 | 0 |
| 473.65422391 | 0 |
| 473.76759005 | 0.001 |
| 473.88095849 | 0 |
| 473.99432923 | 0 |
| 474.10770229 | 0 |
| 474.22107766 | 0 |
| 474.33445535 | 0 |
| 474.44783537 | 0 |
| 474.56121771 | 0 |
| 474.67460239 | 0 |
| 474.78798941 | 0 |
| 474.90137876 | 0 |
| 475.01477047 | 0 |
| 475.12816453 | 0 |
| 475.24156094 | 0 |
| 475.35495971 | 0 |
| 475.46836085 | 0 |
| 475.58176435 | 0 |
| 475.69517023 | 0 |
| 475.80857848 | 0 |
| 475.92198912 | 0 |
| 476.03540214 | 0 |
| 476.14881756 | 0 |
| 476.26223537 | 0 |
| 476.37565558 | 0 |
| 476.48907819 | 0 |
| 476.60250322 | 0 |
| 476.71593065 | 0 |
| 476.8293605 | 0 |
| 476.94279278 | 0 |
| 477.05622748 | 0 |
| 477.16966461 | 0 |
| 477.28310418 | 0.001 |
| 477.39654619 | 0 |
| 477.50999064 | 0 |
| 477.62343753 | 0 |
| 477.73688689 | 0 |
| 477.8503387 | 0 |
| 477.96379297 | 0 |
| 478.0772497 | 0 |
| 478.19070891 | 0 |
| 478.30417059 | 0 |
| 478.41763476 | 0 |
| 478.5311014 | 0 |
| 478.64457054 | 0 |
| 478.75804216 | 0 |
| 478.87151629 | 0 |
| 478.98499291 | 0 |
| 479.09847204 | 0.001 |
| 479.21195368 | 0 |
| 479.32543784 | 0 |
| 479.43892452 | 0 |
| 479.55241372 | 0 |
| 479.66590544 | 0 |
| 479.7793997 | 0 |
| 479.8928965 | 0 |
| 480.00639584 | 0 |
| 480.11989772 | 0 |
| 480.23340216 | 0 |
| 480.34690915 | 0 |
| 480.4604187 | 0 |
| 480.57393081 | 0 |
| 480.68744549 | 0 |
| 480.80096274 | 0 |
| 480.91448257 | 0 |
| 481.02800498 | 0 |
| 481.14152997 | 0 |
| 481.25505756 | 0 |
| 481.36858774 | 0 |
| 481.48212052 | 0 |
| 481.5956559 | 0 |
| 481.70919389 | 0 |
| 481.82273449 | 0 |
| 481.93627771 | 0 |
| 482.04982355 | 0 |
| 482.16337202 | 0 |
| 482.27692311 | 0 |
| 482.39047684 | 0 |
| 482.50403321 | 0 |
| 482.61759222 | 0 |
| 482.73115388 | 0 |
| 482.84471819 | 0 |
| 482.95828516 | 0 |
| 483.07185479 | 0 |
| 483.18542708 | 0 |
| 483.29900205 | 0 |
| 483.41257969 | 0 |
| 483.52616 | 0 |
| 483.639743 | 0 |
| 483.75332869 | 0 |
| 483.86691707 | 0 |
| 483.98050814 | 0 |
| 484.09410192 | 0.001 |
| 484.2076984 | 0 |
| 484.32129759 | 0 |
| 484.43489949 | 0.001 |
| 484.54850412 | 0 |
| 484.66211146 | 0 |
| 484.77572154 | 0 |
| 484.88933434 | 0 |
| 485.00294988 | 0 |
| 485.11656816 | 0 |
| 485.23018919 | 0 |
| 485.34381296 | 0 |
| 485.45743949 | 0 |
| 485.57106878 | 0 |
| 485.68470083 | 0.001 |
| 485.79833565 | 0.001 |
| 485.91197324 | 0 |
| 486.02561361 | 0 |
| 486.13925675 | 0 |
| 486.25290268 | 0 |
| 486.3665514 | 0 |
| 486.48020291 | 0 |
| 486.59385723 | 0 |
| 486.70751434 | 0 |
| 486.82117426 | 0 |
| 486.93483699 | 0 |
| 487.04850254 | 0 |
| 487.16217091 | 0 |
| 487.2758421 | 0 |
| 487.38951613 | 0 |
| 487.50319298 | 0 |
| 487.61687267 | 0 |
| 487.73055521 | 0 |
| 487.84424059 | 0 |
| 487.95792883 | 0 |
| 488.07161992 | 0 |
| 488.18531387 | 0 |
| 488.29901068 | 0 |
| 488.41271036 | 0 |
| 488.52641292 | 0 |
| 488.64011835 | 0 |
| 488.75382667 | 0 |
| 488.86753787 | 0 |
| 488.98125197 | 0 |
| 489.09496896 | 0 |
| 489.20868885 | 0 |
| 489.32241164 | 0 |
| 489.43613734 | 0.001 |
| 489.54986596 | 0 |
| 489.66359749 | 0.001 |
| 489.77733195 | 0 |
| 489.89106933 | 0.002 |
| 490.00480964 | 0 |
| 490.11855289 | 0.001 |
| 490.23229908 | 0 |
| 490.34604821 | 0 |
| 490.45980029 | 0 |
| 490.57355532 | 0.001 |
| 490.68731331 | 0 |
| 490.80107427 | 0.001 |
| 490.91483818 | 0 |
| 491.02860507 | 0.001 |
| 491.14237494 | 0 |
| 491.25614778 | 0.002 |
| 491.36992361 | 0 |
| 491.48370243 | 0.002 |
| 491.59748423999997 | 0 |
| 491.71126905 | 0 |
| 491.82505685 | 0 |
| 491.93884767 | 0.001 |
| 492.05264149 | 0 |
| 492.16643834 | 0.001 |
| 492.28023819 | 0 |
| 492.39404108 | 0.001 |
| 492.50784699 | 0 |
| 492.62165594 | 0.002 |
| 492.73546792 | 0 |
| 492.84928294 | 0.001 |
| 492.96310101 | 0 |
| 493.07692213 | 0.001 |
| 493.1907463 | 0 |
| 493.30457354 | 0.001 |
| 493.41840383 | 0 |
| 493.5322372 | 0.002 |
| 493.64607364 | 0 |
| 493.75991315 | 0.001 |
| 493.87375575 | 0 |
| 493.98760143 | 0.002 |
| 494.1014502 | 0 |
| 494.21530207 | 0.002 |
| 494.32915704 | 0 |
| 494.44301511 | 0.001 |
| 494.55687628 | 0 |
| 494.67074057 | 0.001 |
| 494.78460798 | 0 |
| 494.89847851 | 0.001 |
| 495.01235216 | 0 |
| 495.12622895 | 0.001 |
| 495.24010886 | 0 |
| 495.35399192 | 0.001 |
| 495.46787812 | 0 |
| 495.58176747 | 0.001 |
| 495.69565997 | 0 |
| 495.80955563 | 0.001 |
| 495.92345444 | 0 |
| 496.03735643 | 0.002 |
| 496.15126158 | 0 |
| 496.26516991 | 0.001 |
| 496.37908142 | 0 |
| 496.49299611 | 0.001 |
| 496.60691398 | 0 |
| 496.72083505 | 0.002 |
| 496.83475932 | 0 |
| 496.94868678 | 0.001 |
| 497.06261746 | 0 |
| 497.17655134 | 0.001 |
| 497.29048843 | 0 |
| 497.40442875 | 0.001 |
| 497.51837229 | 0 |
| 497.63231905 | 0.002 |
| 497.74626905 | 0 |
| 497.86022228 | 0.001 |
| 497.97417875 | 0 |
| 498.08813847 | 0.001 |
| 498.20210144 | 0 |
| 498.31606766 | 0.002 |
| 498.43003714 | 0 |
| 498.54400989 | 0.001 |
| 498.6579859 | 0 |
| 498.77196518 | 0.001 |
| 498.88594774 | 0 |
| 498.99993358 | 0.001 |
| 499.11392271 | 0 |
| 499.22791512 | 0.001 |
| 499.34191083 | 0 |
| 499.45590983 | 0.001 |
| 499.56991214 | 0 |
| 499.68391776 | 0.001 |
| 499.79792668 | 0 |
| 499.91193893 | 0 |
| 500.02595449 | 0 |
| 500.13997338 | 0.002 |
| 500.2539956 | 0 |
| 500.36802115 | 0.001 |
| 500.48205004 | 0 |
| 500.59608227 | 0.001 |
| 500.71011785 | 0 |
| 500.82415678 | 0 |
| 500.93819907 | 0 |
| 501.05224471 | 0.002 |
| 501.16629372 | 0 |
| 501.2803461 | 0.001 |
| 501.39440186 | 0 |
| 501.50846099 | 0.002 |
| 501.6225235 | 0 |
| 501.7365894 | 0.001 |
| 501.8506587 | 0 |
| 501.96473138 | 0 |
| 502.07880747 | 0 |
| 502.19288696 | 0.002 |
| 502.30696986 | 0 |
| 502.42105618 | 0.002 |
| 502.53514591 | 0 |
| 502.64923906 | 0.002 |
| 502.76333565 | 0 |
| 502.87743566 | 0.001 |
| 502.99153911 | 0 |
| 503.10564599 | 0.001 |
| 503.21975632 | 0 |
| 503.3338701 | 0.002 |
| 503.44798734 | 0 |
| 503.56210803 | 0.002 |
| 503.67623218 | 0 |
| 503.7903598 | 0.002 |
| 503.90449089 | 0 |
| 504.01862546 | 0.001 |
| 504.13276351 | 0 |
| 504.24690504 | 0.001 |
| 504.36105005 | 0 |
| 504.47519857 | 0.002 |
| 504.58935057 | 0 |
| 504.70350609 | 0.002 |
| 504.8176651 | 0 |
| 504.93182763 | 0.001 |
| 505.04599367 | 0 |
| 505.16016324 | 0.001 |
| 505.27433632 | 0 |
| 505.38851294 | 0.002 |
| 505.50269309 | 0 |
| 505.61687677 | 0.001 |
| 505.731064 | 0 |
| 505.84525477 | 0.001 |
| 505.95944909 | 0 |
| 506.07364697 | 0 |
| 506.18784841 | 0 |
| 506.30205341 | 0.001 |
| 506.41626198 | 0 |
| 506.53047412 | 0.003 |
| 506.64468984 | 0 |
| 506.75890915 | 0.002 |
| 506.87313203 | 0 |
| 506.98735851 | 0.002 |
| 507.10158858 | 0 |
| 507.21582226 | 0.001 |
| 507.33005953 | 0 |
| 507.44430041 | 0.001 |
| 507.55854491 | 0 |
| 507.67279302 | 0.002 |
| 507.78704476 | 0 |
| 507.90130012 | 0.001 |
| 508.01555911 | 0 |
| 508.12982173 | 0.001 |
| 508.244088 | 0 |
| 508.35835791 | 0.002 |
| 508.47263146 | 0 |
| 508.58690867 | 0.003 |
| 508.70118953 | 0 |
| 508.81547406 | 0.001 |
| 508.92976225 | 0 |
| 509.04405411 | 0.002 |
| 509.15834965 | 0 |
| 509.27264886 | 0.001 |
| 509.38695176 | 0 |
| 509.50125835 | 0.002 |
| 509.61556863 | 0 |
| 509.7298826 | 0.002 |
| 509.84420028 | 0 |
| 509.95852166 | 0.001 |
| 510.07284675 | 0 |
| 510.18717556 | 0.001 |
| 510.30150808 | 0 |
| 510.41584433 | 0.001 |
| 510.53018431 | 0 |
| 510.64452801 | 0.001 |
| 510.75887546 | 0 |
| 510.87322664 | 0.002 |
| 510.98758157 | 0 |
| 511.10194025 | 0.001 |
| 511.21630269 | 0 |
| 511.33066888 | 0.001 |
| 511.44503883 | 0 |
| 511.55941256 | 0.001 |
| 511.67379005 | 0 |
| 511.78817132 | 0.001 |
| 511.90255638 | 0 |
| 512.01694521 | 0.001 |
| 512.13133784 | 0 |
| 512.24573426 | 0.001 |
| 512.36013448 | 0 |
| 512.4745385 | 0.001 |
| 512.58894633 | 0 |
| 512.70335797 | 0.001 |
| 512.81777343 | 0 |
| 512.93219271 | 0.002 |
| 513.04661581 | 0 |
| 513.16104274 | 0.001 |
| 513.27547351 | 0 |
| 513.38990811 | 0.002 |
| 513.50434656 | 0 |
| 513.61878885 | 0.002 |
| 513.733235 | 0 |
| 513.847685 | 0 |
| 513.96213886 | 0 |
| 514.07659659 | 0.002 |
| 514.19105818 | 0 |
| 514.30552365 | 0.001 |
| 514.419993 | 0 |
| 514.53446623 | 0.001 |
| 514.64894335 | 0 |
| 514.76342436 | 0 |
| 514.87790926 | 0 |
| 514.99239807 | 0.001 |
| 515.10689077 | 0 |
| 515.22138739 | 0.001 |
| 515.33588792 | 0 |
| 515.45039237 | 0.001 |
| 515.56490075 | 0 |
| 515.67941305 | 0.001 |
| 515.79392928 | 0 |
| 515.90844944 | 0.001 |
| 516.02297355 | 0 |
| 516.1375016 | 0.002 |
| 516.2520336 | 0 |
| 516.36656955 | 0.001 |
| 516.48110946 | 0 |
| 516.59565333 | 0.002 |
| 516.71020117 | 0 |
| 516.82475298 | 0.002 |
| 516.93930877 | 0 |
| 517.05386853 | 0.001 |
| 517.16843228 | 0 |
| 517.28300002 | 0.001 |
| 517.39757175 | 0 |
| 517.51214748 | 0.001 |
| 517.62672722 | 0 |
| 517.74131095 | 0.002 |
| 517.8558987 | 0 |
| 517.97049047 | 0.001 |
| 518.08508625 | 0 |
| 518.19968606 | 0.001 |
| 518.3142899 | 0 |
| 518.42889777 | 0.002 |
| 518.54350967 | 0 |
| 518.65812562 | 0 |
| 518.77274562 | 0 |
| 518.88736966 | 0 |
| 519.00199776 | 0 |
| 519.11662992 | 0 |
| 519.23126615 | 0 |
| 519.34590644 | 0 |
| 519.46055081 | 0 |
| 519.57519925 | 0 |
| 519.68985178 | 0 |
| 519.80450839 | 0 |
| 519.91916909 | 0 |
| 520.03383389 | 0 |
| 520.14850278 | 0 |
| 520.26317578 | 0 |
| 520.37785289 | 0 |
| 520.49253411 | 0 |
| 520.60721945 | 0 |
| 520.72190891 | 0 |
| 520.8366025 | 0 |
| 520.95130021 | 0 |
| 521.06600206 | 0 |
| 521.18070805 | 0 |
| 521.29541819 | 0 |
| 521.41013247 | 0 |
| 521.5248509 | 0 |
| 521.63957349 | 0 |
| 521.75430025 | 0 |
| 521.86903117 | 0 |
| 521.98376625 | 0 |
| 522.09850552 | 0 |
| 522.21324896 | 0 |
| 522.32799659 | 0 |
| 522.4427484 | 0 |
| 522.55750441 | 0 |
| 522.67226461 | 0 |
| 522.78702901 | 0 |
| 522.90179762 | 0 |
| 523.01657044 | 0 |
| 523.13134748 | 0 |
| 523.24612873 | 0 |
| 523.36091421 | 0 |
| 523.47570391 | 0 |
| 523.59049785 | 0 |
| 523.70529602 | 0 |
| 523.82009844 | 0.001 |
| 523.9349051 | 0 |
| 524.04971601 | 0 |
| 524.16453117 | 0 |
| 524.2793506 | 0 |
| 524.39417428 | 0.001 |
| 524.50900224 | 0 |
| 524.62383446 | 0 |
| 524.73867096 | 0 |
| 524.85351175 | 0 |
| 524.96835681 | 0 |
| 525.08320617 | 0.001 |
| 525.19805983 | 0 |
| 525.31291778 | 0 |
| 525.42778003 | 0 |
| 525.54264659 | 0 |
| 525.65751747 | 0 |
| 525.77239265 | 0 |
| 525.88727216 | 0 |
| 526.002156 | 0 |
| 526.11704417 | 0 |
| 526.23193666 | 0 |
| 526.3468335 | 0 |
| 526.46173468 | 0 |
| 526.57664021 | 0 |
| 526.69155009 | 0 |
| 526.80646432 | 0 |
| 526.92138292 | 0 |
| 527.03630588 | 0 |
| 527.15123321 | 0 |
| 527.26616492 | 0 |
| 527.381101 | 0 |
| 527.49604146 | 0 |
| 527.61098632 | 0 |
| 527.72593556 | 0.001 |
| 527.8408892 | 0 |
| 527.95584724 | 0 |
| 528.07080969 | 0 |
| 528.18577654 | 0 |
| 528.30074781 | 0 |
| 528.41572349 | 0 |
| 528.5307036 | 0 |
| 528.64568814 | 0 |
| 528.7606771 | 0 |
| 528.87567051 | 0 |
| 528.99066835 | 0 |
| 529.10567064 | 0 |
| 529.22067738 | 0 |
| 529.33568857 | 0 |
| 529.45070421 | 0 |
| 529.56572432 | 0 |
| 529.6807489 | 0 |
| 529.79577795 | 0 |
| 529.91081147 | 0 |
| 530.02584948 | 0 |
| 530.14089197 | 0 |
| 530.25593894 | 0 |
| 530.37099042 | 0 |
| 530.48604638 | 0 |
| 530.60110686 | 0 |
| 530.71617183 | 0 |
| 530.83124132 | 0 |
| 530.94631533 | 0 |
| 531.06139385 | 0 |
| 531.1764769 | 0.001 |
| 531.29156448 | 0 |
| 531.40665659 | 0 |
| 531.52175323 | 0 |
| 531.63685442 | 0.001 |
| 531.75196016 | 0 |
| 531.86707045 | 0 |
| 531.98218529 | 0 |
| 532.09730469 | 0 |
| 532.21242866 | 0 |
| 532.3275572 | 0 |
| 532.4426903 | 0 |
| 532.55782799 | 0 |
| 532.67297026 | 0 |
| 532.78811711 | 0 |
| 532.90326855 | 0 |
| 533.01842459 | 0 |
| 533.13358523 | 0 |
| 533.24875048 | 0 |
| 533.36392033 | 0 |
| 533.47909479 | 0 |
| 533.59427388 | 0 |
| 533.70945758 | 0.001 |
| 533.82464591 | 0 |
| 533.93983887 | 0 |
| 534.05503646 | 0 |
| 534.1702387 | 0.001 |
| 534.28544558 | 0 |
| 534.4006571 | 0 |
| 534.51587328 | 0 |
| 534.63109412 | 0 |
| 534.74631962 | 0 |
| 534.86154978 | 0 |
| 534.97678462 | 0 |
| 535.09202413 | 0 |
| 535.20726831 | 0 |
| 535.32251719 | 0 |
| 535.43777075 | 0 |
| 535.553029 | 0.001 |
| 535.66829195 | 0 |
| 535.7835596 | 0 |
| 535.89883196 | 0 |
| 536.01410903 | 0 |
| 536.12939081 | 0 |
| 536.24467731 | 0 |
| 536.35996853 | 0 |
| 536.47526449 | 0 |
| 536.59056517 | 0 |
| 536.70587059 | 0 |
| 536.82118075 | 0 |
| 536.93649566 | 0 |
| 537.05181532 | 0 |
| 537.16713973 | 0.001 |
| 537.28246891 | 0 |
| 537.39780284 | 0 |
| 537.51314155 | 0 |
| 537.62848502 | 0 |
| 537.74383327 | 0 |
| 537.85918631 | 0 |
| 537.97454412 | 0 |
| 538.08990673 | 0 |
| 538.20527413 | 0 |
| 538.32064634 | 0 |
| 538.43602334 | 0 |
| 538.55140515 | 0 |
| 538.66679178 | 0 |
| 538.78218322 | 0 |
| 538.89757948 | 0 |
| 539.01298057 | 0 |
| 539.12838648 | 0 |
| 539.24379723 | 0 |
| 539.35921282 | 0 |
| 539.47463326 | 0 |
| 539.59005854 | 0 |
| 539.70548867 | 0 |
| 539.82092366 | 0 |
| 539.93636351 | 0 |
| 540.05180822 | 0 |
| 540.1672578 | 0 |
| 540.28271226 | 0 |
| 540.3981716 | 0 |
| 540.51363582 | 0 |
| 540.62910492 | 0 |
| 540.74457892 | 0 |
| 540.86005781 | 0 |
| 540.97554161 | 0 |
| 541.09103031 | 0 |
| 541.20652392 | 0 |
| 541.32202244 | 0 |
| 541.43752588 | 0 |
| 541.55303424 | 0 |
| 541.66854753 | 0 |
| 541.78406576 | 0 |
| 541.89958892 | 0 |
| 542.01511701 | 0 |
| 542.13065006 | 0 |
| 542.24618805 | 0 |
| 542.361731 | 0.001 |
| 542.4772789 | 0 |
| 542.59283177 | 0 |
| 542.7083896 | 0 |
| 542.82395241 | 0 |
| 542.93952019 | 0.001 |
| 543.05509295 | 0 |
| 543.1706707 | 0 |
| 543.28625343 | 0 |
| 543.40184116 | 0 |
| 543.51743389 | 0 |
| 543.63303162 | 0 |
| 543.74863435 | 0 |
| 543.8642421 | 0 |
| 543.97985486 | 0 |
| 544.09547265 | 0 |
| 544.21109545 | 0 |
| 544.32672329 | 0 |
| 544.44235616 | 0 |
| 544.55799407 | 0 |
| 544.67363702 | 0 |
| 544.78928501 | 0 |
| 544.90493806 | 0 |
| 545.02059616 | 0 |
| 545.13625933 | 0 |
| 545.25192755 | 0 |
| 545.36760085 | 0 |
| 545.48327922 | 0 |
| 545.59896267 | 0 |
| 545.71465119 | 0 |
| 545.83034481 | 0 |
| 545.94604351 | 0 |
| 546.06174732 | 0 |
| 546.17745622 | 0 |
| 546.29317022 | 0 |
| 546.40888934 | 0 |
| 546.52461356 | 0 |
| 546.64034291 | 0 |
| 546.75607737 | 0 |
| 546.87181697 | 0 |
| 546.98756169 | 0 |
| 547.10331155 | 0 |
| 547.21906655 | 0 |
| 547.33482669 | 0 |
| 547.45059198 | 0 |
| 547.56636242 | 0 |
| 547.68213802 | 0 |
| 547.79791878 | 0 |
| 547.91370471 | 0 |
| 548.02949581 | 0 |
| 548.14529208 | 0.002 |
| 548.26109354 | 0 |
| 548.37690018 | 0.001 |
| 548.492712 | 0 |
| 548.60852902 | 0.001 |
| 548.72435123 | 0 |
| 548.84017865 | 0.002 |
| 548.95601127 | 0 |
| 549.07184911 | 0.001 |
| 549.18769215 | 0 |
| 549.30354042 | 0 |
| 549.41939391 | 0 |
| 549.53525263 | 0.002 |
| 549.65111658 | 0 |
| 549.76698577 | 0.002 |
| 549.8828602 | 0 |
| 549.99873988 | 0 |
| 550.1146248 | 0 |
| 550.23051498 | 0.001 |
| 550.34641042 | 0 |
| 550.46231113 | 0.001 |
| 550.5782171 | 0 |
| 550.69412834 | 0.002 |
| 550.81004486 | 0 |
| 550.92596666 | 0 |
| 551.04189375 | 0 |
| 551.15782613 | 0.001 |
| 551.2737638 | 0 |
| 551.38970677 | 0.001 |
| 551.50565504 | 0 |
| 551.62160863 | 0.001 |
| 551.73756752 | 0 |
| 551.85353173 | 0.001 |
| 551.96950126 | 0 |
| 552.08547612 | 0.001 |
| 552.20145631 | 0 |
| 552.31744183 | 0.001 |
| 552.43343269 | 0 |
| 552.54942889 | 0.001 |
| 552.66543044 | 0 |
| 552.78143735 | 0.002 |
| 552.8974496 | 0 |
| 553.01346723 | 0.002 |
| 553.12949021 | 0 |
| 553.24551857 | 0.001 |
| 553.3615523 | 0 |
| 553.4775914 | 0.002 |
| 553.5936359 | 0 |
| 553.70968577 | 0 |
| 553.82574104 | 0 |
| 553.94180171 | 0.001 |
| 554.05786778 | 0 |
| 554.17393925 | 0.002 |
| 554.29001613 | 0 |
| 554.40609843 | 0.001 |
| 554.52218615 | 0 |
| 554.63827928 | 0.001 |
| 554.75437785 | 0 |
| 554.87048184 | 0.001 |
| 554.98659128 | 0 |
| 555.10270615 | 0.002 |
| 555.21882647 | 0 |
| 555.33495224 | 0.001 |
| 555.45108346 | 0 |
| 555.56722014 | 0 |
| 555.68336228 | 0 |
| 555.79950989 | 0.001 |
| 555.91566297 | 0 |
| 556.03182153 | 0.001 |
| 556.14798557 | 0 |
| 556.26415509 | 0.002 |
| 556.3803301 | 0 |
| 556.49651061 | 0.001 |
| 556.61269661 | 0 |
| 556.72888811 | 0.001 |
| 556.84508513 | 0 |
| 556.96128765 | 0.002 |
| 557.07749569 | 0 |
| 557.19370925 | 0.001 |
| 557.30992834 | 0 |
| 557.42615295 | 0.002 |
| 557.5423831 | 0 |
| 557.65861878 | 0.001 |
| 557.77486001 | 0 |
| 557.89110679 | 0.002 |
| 558.00735911 | 0 |
| 558.12361699 | 0.001 |
| 558.23988044 | 0 |
| 558.35614944 | 0.002 |
| 558.47242402 | 0 |
| 558.58870417 | 0.001 |
| 558.70498989 | 0 |
| 558.8212812 | 0 |
| 558.9375781 | 0 |
| 559.05388058 | 0.001 |
| 559.17018866 | 0 |
| 559.28650234 | 0.002 |
| 559.40282163 | 0 |
| 559.51914653 | 0.002 |
| 559.63547703 | 0 |
| 559.75181316 | 0.002 |
| 559.86815491 | 0 |
| 559.98450228 | 0.001 |
| 560.10085528 | 0 |
| 560.21721392 | 0.001 |
| 560.3335782 | 0 |
| 560.44994813 | 0.001 |
| 560.5663237 | 0 |
| 560.68270493 | 0.002 |
| 560.79909181 | 0 |
| 560.91548435 | 0.001 |
| 561.03188257 | 0 |
| 561.14828645 | 0.001 |
| 561.26469601 | 0 |
| 561.38111124 | 0.001 |
| 561.49753216 | 0 |
| 561.61395877 | 0.001 |
| 561.73039107 | 0 |
| 561.84682907 | 0.002 |
| 561.96327277 | 0 |
| 562.07972218 | 0.001 |
| 562.1961773 | 0 |
| 562.31263813 | 0.002 |
| 562.42910468 | 0 |
| 562.54557696 | 0.002 |
| 562.66205496 | 0 |
| 562.7785387 | 0.002 |
| 562.89502818 | 0 |
| 563.01152339 | 0 |
| 563.12802435 | 0 |
| 563.24453106 | 0.001 |
| 563.36104353 | 0 |
| 563.47756176 | 0.001 |
| 563.59408575 | 0 |
| 563.71061551 | 0.001 |
| 563.82715104 | 0 |
| 563.94369234 | 0.002 |
| 564.06023943 | 0 |
| 564.17679231 | 0.001 |
| 564.29335097 | 0 |
| 564.40991543 | 0.001 |
| 564.52648569 | 0 |
| 564.64306175 | 0 |
| 564.75964362 | 0 |
| 564.8762313 | 0.001 |
| 564.9928248 | 0 |
| 565.10942412 | 0.002 |
| 565.22602927 | 0 |
| 565.34264025 | 0.001 |
| 565.45925706 | 0 |
| 565.57587971 | 0.002 |
| 565.6925082 | 0 |
| 565.80914254 | 0.001 |
| 565.92578273 | 0 |
| 566.04242878 | 0.001 |
| 566.15908069 | 0 |
| 566.27573847 | 0.001 |
| 566.39240211 | 0 |
| 566.50907163 | 0.001 |
| 566.62574703 | 0 |
| 566.74242832 | 0.001 |
| 566.85911549 | 0 |
| 566.97580855 | 0.001 |
| 567.09250751 | 0 |
| 567.20921237 | 0.002 |
| 567.32592313 | 0 |
| 567.4426398 | 0.001 |
| 567.55936239 | 0 |
| 567.6760909 | 0.001 |
| 567.79282533 | 0 |
| 567.90956569 | 0.001 |
| 568.02631198 | 0 |
| 568.1430642 | 0.001 |
| 568.25982237 | 0 |
| 568.37658648 | 0.002 |
| 568.49335654 | 0 |
| 568.61013256 | 0.001 |
| 568.72691453 | 0 |
| 568.84370247 | 0.002 |
| 568.96049637 | 0 |
| 569.07729625 | 0.002 |
| 569.1941021 | 0 |
| 569.31091393 | 0.002 |
| 569.42773175 | 0 |
| 569.54455555 | 0.002 |
| 569.66138536 | 0 |
| 569.77822115 | 0.001 |
| 569.89506296 | 0 |
| 570.01191076 | 0.001 |
| 570.12876458 | 0 |
| 570.24562442 | 0.001 |
| 570.36249028 | 0 |
| 570.47936216 | 0.003 |
| 570.59624007 | 0 |
| 570.71312401 | 0.001 |
| 570.830014 | 0 |
| 570.94691002 | 0.002 |
| 571.06381209 | 0 |
| 571.18072022 | 0.002 |
| 571.29763439 | 0 |
| 571.41455463 | 0.001 |
| 571.53148094 | 0 |
| 571.64841331 | 0.002 |
| 571.76535176 | 0 |
| 571.88229628 | 0.001 |
| 571.99924689 | 0 |
| 572.11620358 | 0.002 |
| 572.23316637 | 0 |
| 572.35013525 | 0.002 |
| 572.46711023 | 0 |
| 572.58409131 | 0.002 |
| 572.70107851 | 0 |
| 572.81807181 | 0.002 |
| 572.93507124 | 0 |
| 573.05207679 | 0.001 |
| 573.16908846 | 0 |
| 573.28610627 | 0.001 |
| 573.40313021 | 0 |
| 573.52016029 | 0.002 |
| 573.63719651 | 0 |
| 573.75423889 | 0.003 |
| 573.87128741 | 0 |
| 573.9883421 | 0 |
| 574.10540294 | 0 |
| 574.22246996 | 0 |
| 574.33954314 | 0 |
| 574.4566225 | 0.001 |
| 574.57370804 | 0 |
| 574.69079976 | 0.001 |
| 574.80789767 | 0 |
| 574.92500178 | 0.002 |
| 575.04211208 | 0 |
| 575.15922858 | 0 |
| 575.27635129 | 0 |
| 575.39348021 | 0.001 |
| 575.51061535 | 0 |
| 575.62775671 | 0.002 |
| 575.74490429 | 0 |
| 575.86205809 | 0.002 |
| 575.97921814 | 0 |
| 576.09638441 | 0.002 |
| 576.21355693 | 0 |
| 576.3307357 | 0.001 |
| 576.44792072 | 0 |
| 576.56511199 | 0.001 |
| 576.68230952 | 0 |
| 576.79951332 | 0.003 |
| 576.91672338 | 0 |
| 577.03393971 | 0.002 |
| 577.15116233 | 0 |
| 577.26839122 | 0.002 |
| 577.3856264 | 0 |
| 577.50286787 | 0.002 |
| 577.62011564 | 0 |
| 577.73736971 | 0.002 |
| 577.85463007 | 0 |
| 577.97189675 | 0 |
| 578.08916974 | 0 |
| 578.20644905 | 0 |
| 578.32373467 | 0 |
| 578.44102663 | 0 |
| 578.55832491 | 0 |
| 578.67562953 | 0 |
| 578.79294049 | 0.001 |
| 578.91025779 | 0 |
| 579.02758144 | 0 |
| 579.14491144 | 0 |
| 579.2622478 | 0 |
| 579.37959052 | 0 |
| 579.4969396 | 0 |
| 579.61429506 | 0 |
| 579.73165689 | 0 |
| 579.8490251 | 0 |
| 579.96639969 | 0 |
| 580.08378067 | 0 |
| 580.20116804 | 0 |
| 580.31856181 | 0 |
| 580.43596198 | 0 |
| 580.55336855 | 0.001 |
| 580.67078154 | 0 |
| 580.78820094 | 0 |
| 580.90562676 | 0 |
| 581.023059 | 0 |
| 581.14049767 | 0.001 |
| 581.25794277 | 0 |
| 581.3753943 | 0 |
| 581.49285228 | 0 |
| 581.61031671 | 0 |
| 581.72778758 | 0 |
| 581.84526491 | 0 |
| 581.96274869 | 0 |
| 582.08023894 | 0 |
| 582.19773566 | 0 |
| 582.31523885 | 0 |
| 582.43274851 | 0 |
| 582.55026466 | 0 |
| 582.66778729 | 0 |
| 582.78531641 | 0 |
| 582.90285202 | 0 |
| 583.02039414 | 0 |
| 583.13794275 | 0 |
| 583.25549788 | 0 |
| 583.37305951 | 0 |
| 583.49062766 | 0 |
| 583.60820233 | 0 |
| 583.72578353 | 0 |
| 583.84337125 | 0 |
| 583.96096551 | 0 |
| 584.07856631 | 0 |
| 584.19617365 | 0 |
| 584.31378754 | 0 |
| 584.43140798 | 0 |
| 584.54903497 | 0.001 |
| 584.66666853 | 0 |
| 584.78430865 | 0 |
| 584.90195534 | 0 |
| 585.0196086 | 0 |
| 585.13726845 | 0.001 |
| 585.25493487 | 0.001 |
| 585.37260788 | 0 |
| 585.49028748 | 0 |
| 585.60797368 | 0 |
| 585.72566648 | 0 |
| 585.84336588 | 0 |
| 585.96107189 | 0 |
| 586.07878452 | 0 |
| 586.19650376 | 0 |
| 586.31422963 | 0 |
| 586.43196212 | 0 |
| 586.54970125 | 0 |
| 586.66744701 | 0 |
| 586.78519941 | 0.001 |
| 586.90295845 | 0 |
| 587.02072414 | 0.001 |
| 587.13849649 | 0.001 |
| 587.25627549 | 0 |
| 587.37406116 | 0 |
| 587.49185349 | 0 |
| 587.6096525 | 0 |
| 587.72745818 | 0 |
| 587.84527054 | 0 |
| 587.96308958 | 0 |
| 588.08091531 | 0 |
| 588.19874774 | 0 |
| 588.31658686 | 0 |
| 588.43443269 | 0 |
| 588.55228522 | 0 |
| 588.67014447 | 0 |
| 588.78801042 | 0 |
| 588.9058831 | 0 |
| 589.0237625 | 0 |
| 589.14164863 | 0 |
| 589.2595415 | 0 |
| 589.3774411 | 0 |
| 589.49534744 | 0 |
| 589.61326053 | 0 |
| 589.73118037 | 0 |
| 589.84910697 | 0.001 |
| 589.96704032 | 0 |
| 590.08498044 | 0 |
| 590.20292733 | 0 |
| 590.32088099 | 0 |
| 590.43884143 | 0 |
| 590.55680865 | 0 |
| 590.67478265 | 0 |
| 590.79276345 | 0 |
| 590.91075104 | 0 |
| 591.02874543 | 0 |
| 591.14674662 | 0 |
| 591.26475463 | 0 |
| 591.38276944 | 0 |
| 591.50079107 | 0 |
| 591.61881953 | 0 |
| 591.73685481 | 0 |
| 591.85489692 | 0 |
| 591.97294586 | 0 |
| 592.09100165 | 0 |
| 592.20906427 | 0 |
| 592.32713375 | 0 |
| 592.44521008 | 0 |
| 592.56329327 | 0 |
| 592.68138331 | 0 |
| 592.79948023 | 0 |
| 592.91758401 | 0 |
| 593.03569467 | 0 |
| 593.1538122 | 0 |
| 593.27193662 | 0.001 |
| 593.39006793 | 0 |
| 593.50820613 | 0 |
| 593.62635123 | 0 |
| 593.74450323 | 0 |
| 593.86266213 | 0 |
| 593.98082795 | 0 |
| 594.09900068 | 0 |
| 594.21718032 | 0 |
| 594.3353669 | 0 |
| 594.45356039 | 0 |
| 594.57176083 | 0 |
| 594.68996819 | 0 |
| 594.8081825 | 0 |
| 594.92640376 | 0 |
| 595.04463196 | 0.001 |
| 595.16286712 | 0 |
| 595.28110924 | 0 |
| 595.39935832 | 0 |
| 595.51761437 | 0 |
| 595.63587739 | 0 |
| 595.75414738 | 0 |
| 595.87242436 | 0 |
| 595.99070832 | 0 |
| 596.10899928 | 0 |
| 596.22729722 | 0 |
| 596.34560217 | 0 |
| 596.46391412 | 0 |
| 596.58223307 | 0 |
| 596.70055904 | 0 |
| 596.81889202 | 0 |
| 596.93723203 | 0 |
| 597.05557906 | 0 |
| 597.17393312 | 0 |
| 597.29229421 | 0 |
| 597.41066235 | 0.001 |
| 597.52903752 | 0 |
| 597.64741974 | 0 |
| 597.76580902 | 0 |
| 597.88420535 | 0 |
| 598.00260874 | 0 |
| 598.12101919 | 0 |
| 598.23943672 | 0 |
| 598.35786132 | 0 |
| 598.47629299 | 0 |
| 598.59473175 | 0 |
| 598.7131776 | 0 |
| 598.83163054 | 0 |
| 598.95009057 | 0 |
| 599.06855771 | 0 |
| 599.18703195 | 0 |
| 599.3055133 | 0 |
| 599.42400176 | 0 |
| 599.54249734 | 0 |
| 599.66100004 | 0 |
| 599.77950987 | 0 |
| 599.89802684 | 0 |
| 600.01655093 | 0 |
| 600.13508217 | 0 |
| 600.25362055 | 0.001 |
| 600.37216609 | 0 |
| 600.49071877 | 0 |
| 600.60927861 | 0.001 |
| 600.72784562 | 0 |
| 600.84641979 | 0 |
| 600.96500113 | 0 |
| 601.08358965 | 0 |
| 601.20218535 | 0 |
| 601.32078824 | 0 |
| 601.43939831 | 0.001 |
| 601.55801558 | 0 |
| 601.67664004 | 0 |
| 601.7952717 | 0 |
| 601.91391058 | 0 |
| 602.03255666 | 0 |
| 602.15120996 | 0 |
| 602.26987048 | 0 |
| 602.38853822 | 0 |
| 602.50721319 | 0 |
| 602.6258954 | 0 |
| 602.74458484 | 0 |
| 602.86328153 | 0 |
| 602.98198546 | 0 |
| 603.10069664 | 0 |
| 603.21941508 | 0 |
| 603.33814078 | 0 |
| 603.45687374 | 0 |
| 603.57561397 | 0 |
| 603.69436147 | 0 |
| 603.81311625 | 0.001 |
| 603.93187831 | 0 |
| 604.05064766 | 0 |
| 604.1694243 | 0 |
| 604.28820824 | 0.001 |
| 604.40699947 | 0 |
| 604.52579801 | 0 |
| 604.64460386 | 0 |
| 604.76341702 | 0 |
| 604.88223749 | 0 |
| 605.00106529 | 0 |
| 605.11990042 | 0 |
| 605.23874287 | 0 |
| 605.35759266 | 0 |
| 605.47644979 | 0 |
| 605.59531427 | 0 |
| 605.71418609 | 0 |
| 605.83306526 | 0 |
| 605.95195179 | 0 |
| 606.07084569 | 0 |
| 606.18974695 | 0 |
| 606.30865558 | 0 |
| 606.42757158 | 0 |
| 606.54649497 | 0 |
| 606.66542573 | 0 |
| 606.78436389 | 0 |
| 606.90330944 | 0 |
| 607.02226238 | 0 |
| 607.14122273 | 0 |
| 607.26019048 | 0 |
| 607.37916564 | 0 |
| 607.49814822 | 0 |
| 607.61713822 | 0 |
| 607.73613564 | 0.001 |
| 607.85514048 | 0 |
| 607.97415276 | 0 |
| 608.09317248 | 0 |
| 608.21219964 | 0.001 |
| 608.33123424 | 0 |
| 608.4502763 | 0.001 |
| 608.56932581 | 0 |
| 608.68838277 | 0.002 |
| 608.8074472 | 0 |
| 608.9265191 | 0.001 |
| 609.04559847 | 0 |
| 609.16468532 | 0.001 |
| 609.28377965 | 0 |
| 609.40288146 | 0.001 |
| 609.52199077 | 0 |
| 609.64110756 | 0.001 |
| 609.76023186 | 0 |
| 609.87936366 | 0.002 |
| 609.99850297 | 0 |
| 610.11764979 | 0.002 |
| 610.23680412 | 0 |
| 610.35596598 | 0.002 |
| 610.47513536 | 0 |
| 610.59431228 | 0.001 |
| 610.71349672 | 0 |
| 610.83268871 | 0.002 |
| 610.95188824 | 0 |
| 611.07109531 | 0.002 |
| 611.19030994 | 0 |
| 611.30953212 | 0 |
| 611.42876187 | 0 |
| 611.54799918 | 0.002 |
| 611.66724405 | 0 |
| 611.78649651 | 0.001 |
| 611.90575654 | 0 |
| 612.02502415 | 0.001 |
| 612.14429936 | 0 |
| 612.26358215 | 0.001 |
| 612.38287254 | 0 |
| 612.50217053 | 0 |
| 612.62147612 | 0 |
| 612.74078933 | 0.001 |
| 612.86011015 | 0 |
| 612.97943858 | 0.001 |
| 613.09877464 | 0 |
| 613.21811833 | 0.002 |
| 613.33746965 | 0 |
| 613.4568286 | 0.002 |
| 613.5761952 | 0 |
| 613.69556943 | 0.001 |
| 613.81495132 | 0 |
| 613.93434087 | 0.001 |
| 614.05373807 | 0 |
| 614.17314293 | 0.001 |
| 614.29255546 | 0 |
| 614.41197566 | 0.002 |
| 614.53140354 | 0 |
| 614.65083909 | 0.002 |
| 614.77028234 | 0 |
| 614.88973327 | 0.002 |
| 615.00919189 | 0 |
| 615.12865821 | 0.001 |
| 615.24813224 | 0 |
| 615.36761397 | 0.002 |
| 615.48710341 | 0 |
| 615.60660057 | 0.001 |
| 615.72610545 | 0 |
| 615.84561805 | 0.001 |
| 615.96513839 | 0 |
| 616.08466645 | 0.001 |
| 616.20420226 | 0 |
| 616.3237458 | 0.001 |
| 616.44329709 | 0 |
| 616.56285614 | 0.002 |
| 616.68242293 | 0 |
| 616.80199749 | 0.001 |
| 616.92157982 | 0 |
| 617.04116991 | 0.001 |
| 617.16076777 | 0 |
| 617.28037341 | 0.002 |
| 617.39998684 | 0 |
| 617.51960805 | 0.001 |
| 617.63923705 | 0 |
| 617.75887385 | 0.001 |
| 617.87851845 | 0 |
| 617.99817085 | 0.002 |
| 618.11783106 | 0 |
| 618.23749908 | 0.001 |
| 618.35717492 | 0 |
| 618.47685858 | 0.001 |
| 618.59655007 | 0 |
| 618.71624939 | 0.001 |
| 618.83595654 | 0 |
| 618.95567154 | 0.001 |
| 619.07539438 | 0 |
| 619.19512506 | 0.002 |
| 619.3148636 | 0 |
| 619.43461 | 0.001 |
| 619.55436426 | 0 |
| 619.67412638 | 0.002 |
| 619.79389638 | 0 |
| 619.91367425 | 0.002 |
| 620.03346 | 0 |
| 620.15325363 | 0.001 |
| 620.27305515 | 0 |
| 620.39286456 | 0.002 |
| 620.51268188 | 0 |
| 620.63250709 | 0.001 |
| 620.75234021 | 0 |
| 620.87218124 | 0.001 |
| 620.99203018 | 0 |
| 621.11188704 | 0.001 |
| 621.23175183 | 0 |
| 621.35162455 | 0.001 |
| 621.47150519 | 0 |
| 621.59139378 | 0.002 |
| 621.7112903 | 0 |
| 621.83119478 | 0 |
| 621.9511072 | 0 |
| 622.07102758 | 0.002 |
| 622.19095591 | 0 |
| 622.31089221 | 0.001 |
| 622.43083648 | 0 |
| 622.55078872 | 0.001 |
| 622.67074893 | 0 |
| 622.79071713 | 0.002 |
| 622.91069332 | 0 |
| 623.03067749 | 0.002 |
| 623.15066966 | 0 |
| 623.27066982 | 0.002 |
| 623.39067799 | 0 |
| 623.51069417 | 0 |
| 623.63071836 | 0 |
| 623.75075057 | 0.002 |
| 623.8707908 | 0 |
| 623.99083905 | 0.002 |
| 624.11089533 | 0 |
| 624.23095965 | 0 |
| 624.35103201 | 0 |
| 624.47111241 | 0 |
| 624.59120086 | 0 |
| 624.71129736 | 0.001 |
| 624.83140191 | 0 |
| 624.95151453 | 0 |
| 625.07163521 | 0 |
| 625.19176396 | 0.002 |
| 625.31190079 | 0 |
| 625.43204569 | 0.001 |
| 625.55219868 | 0 |
| 625.67235976 | 0.001 |
| 625.79252892 | 0 |
| 625.91270619 | 0.002 |
| 626.03289155 | 0 |
| 626.15308502 | 0.001 |
| 626.2732866 | 0 |
| 626.39349629 | 0.002 |
| 626.5137141 | 0 |
| 626.63394004 | 0.002 |
| 626.7541741 | 0 |
| 626.87441629 | 0.002 |
| 626.99466662 | 0 |
| 627.11492509 | 0.002 |
| 627.2351917 | 0 |
| 627.35546647 | 0.001 |
| 627.47574939 | 0 |
| 627.59604046 | 0.003 |
| 627.7163397 | 0 |
| 627.83664711 | 0.002 |
| 627.95696269 | 0 |
| 628.07728644 | 0.002 |
| 628.19761837 | 0 |
| 628.31795849 | 0.002 |
| 628.4383068 | 0 |
| 628.5586633 | 0.002 |
| 628.679028 | 0 |
| 628.79940091 | 0.002 |
| 628.91978201 | 0 |
| 629.04017134 | 0.002 |
| 629.16056887 | 0 |
| 629.28097463 | 0.002 |
| 629.40138861 | 0 |
| 629.52181082 | 0.002 |
| 629.64224127 | 0 |
| 629.76267995 | 0.001 |
| 629.88312687 | 0 |
| 630.00358204 | 0.002 |
| 630.12404547 | 0 |
| 630.24451715 | 0.002 |
| 630.36499708 | 0 |
| 630.48548529 | 0.002 |
| 630.60598176 | 0 |
| 630.7264865 | 0.003 |
| 630.84699953 | 0 |
| 630.96752083 | 0.002 |
| 631.08805042 | 0 |
| 631.20858831 | 0.004 |
| 631.32913448 | 0 |
| 631.44968896 | 0.002 |
| 631.57025175 | 0 |
| 631.69082284 | 0.003 |
| 631.81140224 | 0 |
| 631.93198996 | 0.003 |
| 632.05258601 | 0.001 |
| 632.17319038 | 0.004 |
| 632.29380308 | 0.001 |
| 632.41442412 | 0.004 |
| 632.53505349 | 0.001 |
| 632.65569122 | 0.005 |
| 632.77633728 | 0.002 |
| 632.89699171 | 0.006 |
| 633.01765449 | 0.002 |
| 633.13832563 | 0.005 |
| 633.25900514 | 0.002 |
| 633.37969302 | 0.006 |
| 633.50038927 | 0.002 |
| 633.6210939 | 0.008 |
| 633.74180692 | 0.005 |
| 633.86252833 | 0.009 |
| 633.98325813 | 0.006 |
| 634.10399632 | 0.009 |
| 634.22474292 | 0.006 |
| 634.34549793 | 0.011 |
| 634.46626134 | 0.008 |
| 634.58703317 | 0.011 |
| 634.70781342 | 0.01 |
| 634.82860209 | 0.014 |
| 634.94939919 | 0.011 |
| 635.07020473 | 0.013 |
| 635.1910187 | 0.014 |
| 635.31184111 | 0.015 |
| 635.43267197 | 0.014 |
| 635.55351128 | 0.016 |
| 635.67435904 | 0.016 |
| 635.79521527 | 0.018 |
| 635.91607995 | 0.016 |
| 636.03695311 | 0.018 |
| 636.15783473 | 0.017 |
| 636.27872484 | 0.022 |
| 636.39962343 | 0.021 |
| 636.5205305 | 0.023 |
| 636.64144606 | 0.022 |
| 636.76237012 | 0.025 |
| 636.88330267 | 0.026 |
| 637.00424373 | 0.024 |
| 637.1251933 | 0.027 |
| 637.24615138 | 0.03 |
| 637.36711797 | 0.031 |
| 637.48809309 | 0.033 |
| 637.60907673 | 0.033 |
| 637.73006891 | 0.034 |
| 637.85106962 | 0.034 |
| 637.97207886 | 0.038 |
| 638.09309665 | 0.038 |
| 638.21412299 | 0.043 |
| 638.33515788 | 0.045 |
| 638.45620133 | 0.045 |
| 638.57725333 | 0.048 |
| 638.69831391 | 0.048 |
| 638.81938305 | 0.053 |
| 638.94046077 | 0.051 |
| 639.06154707 | 0.053 |
| 639.18264194 | 0.057 |
| 639.30374541 | 0.054 |
| 639.42485747 | 0.059 |
| 639.54597813 | 0.06 |
| 639.66710738 | 0.066 |
| 639.78824525 | 0.064 |
| 639.90939172 | 0.066 |
| 640.0305468 | 0.065 |
| 640.15171051 | 0.068 |
| 640.27288283 | 0.069 |
| 640.39406379 | 0.075 |
| 640.51525338 | 0.073 |
| 640.6364516 | 0.08 |
| 640.75765846 | 0.076 |
| 640.87887397 | 0.083 |
| 641.00009813 | 0.08 |
| 641.12133094 | 0.086 |
| 641.24257241 | 0.087 |
| 641.36382255 | 0.096 |
| 641.48508135 | 0.096 |
| 641.60634882 | 0.1 |
| 641.72762497 | 0.097 |
| 641.8489098 | 0.104 |
| 641.97020332 | 0.107 |
| 642.09150552 | 0.112 |
| 642.21281642 | 0.113 |
| 642.33413601 | 0.119 |
| 642.45546431 | 0.12 |
| 642.57680132 | 0.126 |
| 642.69814704 | 0.13 |
| 642.81950147 | 0.133 |
| 642.94086462 | 0.135 |
| 643.0622365 | 0.143 |
| 643.18361711 | 0.141 |
| 643.30500645 | 0.144 |
| 643.42640453 | 0.145 |
| 643.54781136 | 0.16 |
| 643.66922693 | 0.154 |
| 643.79065125 | 0.163 |
| 643.91208432 | 0.158 |
| 644.03352616 | 0.167 |
| 644.15497676 | 0.167 |
| 644.27643613 | 0.171 |
| 644.39790428 | 0.171 |
| 644.5193812 | 0.177 |
| 644.6408669 | 0.178 |
| 644.76236139 | 0.183 |
| 644.88386468 | 0.185 |
| 645.00537675 | 0.19 |
| 645.12689763 | 0.188 |
| 645.24842732 | 0.197 |
| 645.36996581 | 0.199 |
| 645.49151311 | 0.206 |
| 645.61306924 | 0.21 |
| 645.73463418 | 0.215 |
| 645.85620795 | 0.219 |
| 645.97779056 | 0.228 |
| 646.09938199 | 0.235 |
| 646.22098227 | 0.242 |
| 646.34259139 | 0.248 |
| 646.46420937 | 0.251 |
| 646.58583619 | 0.261 |
| 646.70747187 | 0.275 |
| 646.82911642 | 0.276 |
| 646.95076983 | 0.287 |
| 647.07243211 | 0.288 |
| 647.19410327 | 0.296 |
| 647.3157833 | 0.306 |
| 647.43747222 | 0.308 |
| 647.55917003 | 0.309 |
| 647.68087674 | 0.323 |
| 647.80259233 | 0.325 |
| 647.92431684 | 0.329 |
| 648.04605024 | 0.331 |
| 648.16779256 | 0.343 |
| 648.2895438 | 0.341 |
| 648.41130395 | 0.347 |
| 648.53307303 | 0.345 |
| 648.65485104 | 0.353 |
| 648.77663797 | 0.354 |
| 648.89843385 | 0.357 |
| 649.02023867 | 0.363 |
| 649.14205243 | 0.374 |
| 649.26387515 | 0.373 |
| 649.38570682 | 0.384 |
| 649.50754745 | 0.382 |
| 649.62939704 | 0.39 |
| 649.7512556 | 0.395 |
| 649.87312313 | 0.4 |
| 649.99499965 | 0.414 |
| 650.11688514 | 0.423 |
| 650.23877962 | 0.424 |
| 650.36068309 | 0.437 |
| 650.48259555 | 0.439 |
| 650.60451701 | 0.445 |
| 650.72644748 | 0.454 |
| 650.84838695 | 0.465 |
| 650.97033544 | 0.474 |
| 651.09229295 | 0.485 |
| 651.21425947 | 0.487 |
| 651.33623502 | 0.502 |
| 651.45821961 | 0.508 |
| 651.58021322 | 0.515 |
| 651.70221588 | 0.527 |
| 651.82422758 | 0.539 |
| 651.94624832 | 0.536 |
| 652.06827812 | 0.552 |
| 652.19031698 | 0.554 |
| 652.3123649 | 0.564 |
| 652.43442188 | 0.565 |
| 652.55648793 | 0.571 |
| 652.67856306 | 0.577 |
| 652.80064727 | 0.579 |
| 652.92274056 | 0.584 |
| 653.04484294 | 0.59 |
| 653.16695441 | 0.597 |
| 653.28907497 | 0.598 |
| 653.41120464 | 0.604 |
| 653.53334341 | 0.607 |
| 653.6554913 | 0.614 |
| 653.7776483 | 0.624 |
| 653.89981441 | 0.631 |
| 654.02198965 | 0.639 |
| 654.14417402 | 0.642 |
| 654.26636752 | 0.657 |
| 654.38857015 | 0.658 |
| 654.51078193 | 0.67 |
| 654.63300285 | 0.681 |
| 654.75523292 | 0.686 |
| 654.87747215 | 0.698 |
| 654.99972053 | 0.699 |
| 655.12197808 | 0.716 |
| 655.2442448 | 0.731 |
| 655.36652068 | 0.741 |
| 655.48880575 | 0.756 |
| 655.61109999 | 0.755 |
| 655.73340342 | 0.775 |
| 655.85571604 | 0.796 |
| 655.97803785 | 0.805 |
| 656.10036886 | 0.82 |
| 656.22270908 | 0.834 |
| 656.3450585 | 0.839 |
| 656.46741713 | 0.854 |
| 656.58978498 | 0.861 |
| 656.71216205 | 0.866 |
| 656.83454834 | 0.877 |
| 656.95694387 | 0.879 |
| 657.07934863 | 0.889 |
| 657.20176262 | 0.889 |
| 657.32418586 | 0.885 |
| 657.44661835 | 0.891 |
| 657.56906009 | 0.895 |
| 657.69151108 | 0.893 |
| 657.81397133 | 0.896 |
| 657.93644085 | 0.903 |
| 658.05891964 | 0.905 |
| 658.1814077 | 0.913 |
| 658.30390504 | 0.914 |
| 658.42641166 | 0.915 |
| 658.54892757 | 0.93 |
| 658.67145277 | 0.932 |
| 658.79398727 | 0.94 |
| 658.91653107 | 0.949 |
| 659.03908417 | 0.957 |
| 659.16164658 | 0.966 |
| 659.28421831 | 0.969 |
| 659.40679935 | 0.973 |
| 659.52938971 | 0.981 |
| 659.6519894 | 0.982 |
| 659.77459843 | 0.981 |
| 659.89721678 | 0.985 |
| 660.01984448 | 0.993 |
| 660.14248153 | 0.989 |
| 660.26512792 | 0.993 |
| 660.38778366 | 1 |
| 660.51044877 | 0.988 |
| 660.63312323 | 0.984 |
| 660.75580706 | 0.977 |
| 660.87850027 | 0.984 |
| 661.00120284 | 0.974 |
| 661.1239148 | 0.971 |
| 661.24663614 | 0.966 |
| 661.36936688 | 0.962 |
| 661.492107 | 0.958 |
| 661.61485652 | 0.946 |
| 661.73761545 | 0.934 |
| 661.86038378 | 0.929 |
| 661.98316152 | 0.914 |
| 662.10594868 | 0.9 |
| 662.22874525 | 0.883 |
| 662.35155125 | 0.885 |
| 662.47436668 | 0.867 |
| 662.59719155 | 0.858 |
| 662.72002585 | 0.848 |
| 662.84286959 | 0.834 |
| 662.96572278 | 0.816 |
| 663.08858542 | 0.812 |
| 663.21145751 | 0.802 |
| 663.33433906 | 0.798 |
| 663.45723008 | 0.784 |
| 663.58013057 | 0.781 |
| 663.70304053 | 0.774 |
| 663.82595996 | 0.766 |
| 663.94888888 | 0.75 |
| 664.07182729 | 0.745 |
| 664.19477518 | 0.745 |
| 664.31773257 | 0.734 |
| 664.44069946 | 0.723 |
| 664.56367585 | 0.716 |
| 664.68666175 | 0.701 |
| 664.80965717 | 0.691 |
| 664.9326621 | 0.693 |
| 665.05567655 | 0.684 |
| 665.17870053 | 0.673 |
| 665.30173404 | 0.667 |
| 665.42477708 | 0.652 |
| 665.54782967 | 0.646 |
| 665.67089179 | 0.633 |
| 665.79396347 | 0.635 |
| 665.9170447 | 0.633 |
| 666.04013548 | 0.634 |
| 666.16323583 | 0.619 |
| 666.28634574 | 0.615 |
| 666.40946522 | 0.61 |
| 666.53259428 | 0.599 |
| 666.65573291 | 0.587 |
| 666.77888113 | 0.582 |
| 666.90203894 | 0.568 |
| 667.02520634 | 0.557 |
| 667.14838334 | 0.541 |
| 667.27156994 | 0.539 |
| 667.39476614 | 0.526 |
| 667.51797195 | 0.516 |
| 667.64118738 | 0.511 |
| 667.76441243 | 0.504 |
| 667.8876471 | 0.493 |
| 668.0108914 | 0.487 |
| 668.13414533 | 0.479 |
| 668.25740889 | 0.471 |
| 668.3806821 | 0.459 |
| 668.50396495 | 0.459 |
| 668.62725746 | 0.444 |
| 668.75055962 | 0.443 |
| 668.87387143 | 0.432 |
| 668.99719291 | 0.426 |
| 669.12052406 | 0.423 |
| 669.24386488 | 0.415 |
| 669.36721537 | 0.41 |
| 669.49057555 | 0.407 |
| 669.61394541 | 0.394 |
| 669.73732497 | 0.39 |
| 669.86071421 | 0.383 |
| 669.98411316 | 0.375 |
| 670.1075218 | 0.362 |
| 670.23094016 | 0.352 |
| 670.35436823 | 0.344 |
| 670.47780601 | 0.339 |
| 670.60125351 | 0.331 |
| 670.72471074 | 0.323 |
| 670.8481777 | 0.314 |
| 670.97165439 | 0.304 |
| 671.09514083 | 0.302 |
| 671.218637 | 0.295 |
| 671.34214292 | 0.284 |
| 671.46565859 | 0.275 |
| 671.58918402 | 0.266 |
| 671.71271921 | 0.261 |
| 671.83626417 | 0.255 |
| 671.95981889 | 0.248 |
| 672.08338339 | 0.245 |
| 672.20695767 | 0.234 |
| 672.33054173 | 0.23 |
| 672.45413557 | 0.222 |
| 672.57773921 | 0.217 |
| 672.70135265 | 0.212 |
| 672.82497588 | 0.204 |
| 672.94860892 | 0.195 |
| 673.07225177 | 0.198 |
| 673.19590443 | 0.188 |
| 673.31956691 | 0.187 |
| 673.44323921 | 0.182 |
| 673.56692134 | 0.178 |
| 673.6906133 | 0.174 |
| 673.8143151 | 0.169 |
| 673.93802674 | 0.164 |
| 674.06174822 | 0.158 |
| 674.18547955 | 0.158 |
| 674.30922074 | 0.152 |
| 674.43297178 | 0.149 |
| 674.55673268 | 0.151 |
| 674.68050345 | 0.141 |
| 674.8042841 | 0.14 |
| 674.92807462 | 0.135 |
| 675.05187501 | 0.132 |
| 675.1756853 | 0.128 |
| 675.29950547 | 0.125 |
| 675.42333554 | 0.122 |
| 675.5471755 | 0.118 |
| 675.67102536 | 0.115 |
| 675.79488514 | 0.117 |
| 675.91875482 | 0.11 |
| 676.04263442 | 0.107 |
| 676.16652394 | 0.104 |
| 676.29042338 | 0.103 |
| 676.41433275 | 0.096 |
| 676.53825206 | 0.095 |
| 676.6621813 | 0.093 |
| 676.78612048 | 0.087 |
| 676.91006961 | 0.085 |
| 677.0340287 | 0.081 |
| 677.15799773 | 0.08 |
| 677.28197673 | 0.079 |
| 677.40596569 | 0.074 |
| 677.52996462 | 0.072 |
| 677.65397353 | 0.071 |
| 677.77799241 | 0.07 |
| 677.90202127 | 0.064 |
| 678.02606012 | 0.067 |
| 678.15010896 | 0.059 |
| 678.27416779 | 0.06 |
| 678.39823662 | 0.058 |
| 678.52231546 | 0.055 |
| 678.64640431 | 0.053 |
| 678.77050317 | 0.054 |
| 678.89461204 | 0.051 |
| 679.01873094 | 0.049 |
| 679.14285987 | 0.045 |
| 679.26699882 | 0.045 |
| 679.39114781 | 0.043 |
| 679.51530684 | 0.043 |
| 679.63947592 | 0.038 |
| 679.76365504 | 0.039 |
| 679.88784421 | 0.036 |
| 680.01204344 | 0.038 |
| 680.13625274 | 0.035 |
| 680.2604721 | 0.034 |
| 680.38470153 | 0.03 |
| 680.50894103 | 0.031 |
| 680.63319061 | 0.029 |
| 680.75745028 | 0.027 |
| 680.88172004 | 0.026 |
| 681.00599988 | 0.024 |
| 681.13028983 | 0.024 |
| 681.25458988 | 0.021 |
| 681.37890003 | 0.021 |
| 681.50322029 | 0.023 |
| 681.62755067 | 0.019 |
| 681.75189116 | 0.019 |
| 681.87624178 | 0.018 |
| 682.00060253 | 0.016 |
| 682.12497341 | 0.014 |
| 682.24935443 | 0.014 |
| 682.37374559 | 0.012 |
| 682.49814689 | 0.012 |
| 682.62255834 | 0.011 |
| 682.74697995 | 0.012 |
| 682.87141172 | 0.011 |
| 682.99585365 | 0.011 |
| 683.1203057499999 | 0.009 |
| 683.24476802 | 0.009 |
| 683.36924047 | 0.008 |
| 683.4937231 | 0.009 |
| 683.61821591 | 0.009 |
| 683.74271891 | 0.007 |
| 683.86723211 | 0.007 |
| 683.99175551 | 0.008 |
| 684.11628911 | 0.007 |
| 684.24083292 | 0.006 |
| 684.36538694 | 0.007 |
| 684.48995117 | 0.005 |
| 684.61452563 | 0.006 |
| 684.73911031 | 0.005 |
| 684.86370522 | 0.006 |
| 684.98831037 | 0.004 |
| 685.11292576 | 0.004 |
| 685.23755138 | 0.004 |
| 685.36218726 | 0.005 |
| 685.48683339 | 0.003 |
| 685.61148977 | 0.004 |
| 685.73615642 | 0.003 |
| 685.86083333 | 0.003 |
| 685.9855205 | 0.002 |
| 686.11021796 | 0.004 |
| 686.23492569 | 0.003 |
| 686.3596437 | 0.004 |
| 686.48437201 | 0.001 |
| 686.6091106 | 0.003 |
| 686.73385949 | 0.001 |
| 686.85861868 | 0.002 |
| 686.98338818 | 0.001 |
| 687.10816798 | 0.001 |
| 687.2329581 | 0.001 |
| 687.35775854 | 0.002 |
| 687.4825693 | 0.001 |
| 687.60739038 | 0.002 |
| 687.7322218 | 0.001 |
| 687.85706355 | 0.002 |
| 687.98191565 | 0 |
| 688.10677809 | 0.002 |
| 688.23165088 | 0 |
| 688.35653402 | 0.002 |
| 688.48142752 | 0.001 |
| 688.60633138 | 0.001 |
| 688.73124562 | 0 |
| 688.85617022 | 0.002 |
| 688.98110519 | 0 |
| 689.10605055 | 0.002 |
| 689.23100629 | 0 |
| 689.35597243 | 0.002 |
| 689.48094895 | 0.001 |
| 689.60593587 | 0.001 |
| 689.7309332 | 0 |
| 689.85594093 | 0.002 |
| 689.98095907 | 0 |
| 690.10598763 | 0.001 |
| 690.23102661 | 0 |
| 690.35607602 | 0.001 |
| 690.48113585 | 0 |
| 690.60620611 | 0.001 |
| 690.73128682 | 0 |
| 690.85637796 | 0 |
| 690.98147956 | 0 |
| 691.1065916 | 0.001 |
| 691.2317141 | 0 |
| 691.35684706 | 0.002 |
| 691.48199048 | 0 |
| 691.60714437 | 0.001 |
| 691.73230874 | 0 |
| 691.85748358 | 0.001 |
| 691.98266891 | 0 |
| 692.10786472 | 0.002 |
| 692.23307102 | 0 |
| 692.35828782 | 0.001 |
| 692.48351512 | 0 |
| 692.60875292 | 0.001 |
| 692.73400123 | 0 |
| 692.85926005 | 0 |
| 692.98452939 | 0 |
| 693.10980926 | 0.001 |
| 693.23509965 | 0 |
| 693.36040057 | 0.001 |
| 693.48571202 | 0 |
| 693.61103401 | 0.001 |
| 693.73636655 | 0 |
| 693.86170964 | 0.002 |
| 693.98706328 | 0 |
| 694.11242748 | 0.001 |
| 694.23780224 | 0 |
| 694.36318756 | 0.001 |
| 694.48858346 | 0 |
| 694.61398993 | 0.001 |
| 694.73940698 | 0 |
| 694.86483461 | 0.001 |
| 694.99027283 | 0 |
| 695.11572165 | 0.001 |
| 695.24118106 | 0 |
| 695.36665108 | 0 |
| 695.49213169 | 0 |
| 695.61762292 | 0.001 |
| 695.74312477 | 0 |
| 695.86863723 | 0 |
| 695.99416032 | 0 |
| 696.11969404 | 0.001 |
| 696.24523839 | 0 |
| 696.37079337 | 0.001 |
| 696.496359 | 0 |
| 696.62193527 | 0 |
| 696.74752219 | 0 |
| 696.87311977 | 0 |
| 696.99872801 | 0 |
| 697.12434691 | 0.001 |
| 697.24997648 | 0 |
| 697.37561672 | 0 |
| 697.50126764 | 0 |
| 697.62692923 | 0.001 |
| 697.75260152 | 0 |
| 697.87828449 | 0.001 |
| 698.00397816 | 0 |
| 698.12968253 | 0.001 |
| 698.2553976 | 0 |
| 698.38112338 | 0.001 |
| 698.50685987 | 0 |
| 698.63260708 | 0 |
| 698.75836501 | 0 |
| 698.88413366 | 0 |
| 699.00991305 | 0 |
| 699.13570317 | 0 |
| 699.26150402 | 0 |
| 699.38731562 | 0 |
| 699.51313797 | 0 |
| 699.63897107 | 0.001 |
| 699.7648149300001 | 0 |
| 699.89066955 | 0 |
| 700.01653493 | 0 |
| 700.14241108 | 0 |
| 700.26829801 | 0 |
| 700.39419572 | 0.001 |
| 700.5201042 | 0 |
| 700.64602348 | 0.001 |
| 700.77195355 | 0 |
| 700.89789441 | 0 |
| 701.02384608 | 0 |
| 701.14980855 | 0.001 |
| 701.27578183 | 0 |
| 701.40176592 | 0 |
| 701.52776084 | 0 |
| 701.65376657 | 0.001 |
| 701.77978313 | 0 |
| 701.90581053 | 0.001 |
| 702.03184876 | 0 |
| 702.15789783 | 0 |
| 702.28395774 | 0 |
| 702.41002851 | 0 |
| 702.53611013 | 0 |
| 702.66220261 | 0 |
| 702.78830595 | 0 |
| 702.91442015 | 0 |
| 703.04054523 | 0 |
| 703.16668119 | 0 |
| 703.29282802 | 0 |
| 703.41898574 | 0 |
| 703.54515435 | 0 |
| 703.67133386 | 0 |
| 703.79752426 | 0 |
| 703.92372556 | 0 |
| 704.04993777 | 0 |
| 704.1761609 | 0 |
| 704.30239493 | 0 |
| 704.42863989 | 0 |
| 704.55489577 | 0 |
| 704.68116259 | 0 |
| 704.80744033 | 0 |
| 704.93372902 | 0 |
| 705.06002864 | 0 |
| 705.18633921 | 0.001 |
| 705.31266074 | 0 |
| 705.43899322 | 0.001 |
| 705.56533666 | 0 |
| 705.69169106 | 0 |
| 705.81805644 | 0 |
| 705.94443278 | 0.001 |
| 706.07082011 | 0 |
| 706.19721841 | 0 |
| 706.32362771 | 0 |
| 706.45004799 | 0 |
| 706.57647927 | 0 |
| 706.70292155 | 0 |
| 706.82937483 | 0 |
| 706.95583913 | 0.001 |
| 707.08231443 | 0 |
| 707.20880076 | 0 |
| 707.3352981 | 0 |
| 707.46180648 | 0 |
| 707.58832588 | 0 |
| 707.71485632 | 0 |
| 707.8413978 | 0 |
| 707.96795032 | 0 |
| 708.09451389 | 0 |
| 708.22108851 | 0.001 |
| 708.34767419 | 0 |
| 708.47427094 | 0.001 |
| 708.60087875 | 0 |
| 708.72749763 | 0.001 |
| 708.85412758 | 0 |
| 708.98076862 | 0 |
| 709.10742074 | 0 |
| 709.23408395 | 0 |
| 709.36075825 | 0 |
| 709.48744364 | 0 |
| 709.61414014 | 0 |
| 709.74084775 | 0 |
| 709.86756647 | 0 |
| 709.9942963 | 0 |
| 710.12103725 | 0 |
| 710.24778932 | 0 |
| 710.37455253 | 0 |
| 710.50132686 | 0.001 |
| 710.62811233 | 0 |
| 710.75490895 | 0 |
| 710.88171671 | 0 |
| 711.00853562 | 0 |
| 711.13536569 | 0 |
| 711.26220691 | 0.001 |
| 711.3890593 | 0 |
| 711.51592286 | 0.001 |
| 711.64279759 | 0 |
| 711.76968349 | 0 |
| 711.89658058 | 0 |
| 712.02348885 | 0 |
| 712.15040832 | 0 |
| 712.27733897 | 0 |
| 712.40428083 | 0 |
| 712.53123389 | 0 |
| 712.65819816 | 0 |
| 712.78517364 | 0 |
| 712.91216034 | 0 |
| 713.03915826 | 0.001 |
| 713.16616741 | 0 |
| 713.29318778 | 0 |
| 713.42021939 | 0 |
| 713.54726224 | 0 |
| 713.67431633 | 0 |
| 713.80138167 | 0.001 |
| 713.92845826 | 0 |
| 714.05554611 | 0 |
| 714.18264522 | 0 |
| 714.3097556 | 0 |
| 714.43687724 | 0 |
| 714.56401016 | 0 |
| 714.69115436 | 0 |
| 714.81830984 | 0 |
| 714.94547661 | 0 |
| 715.07265467 | 0 |
| 715.19984403 | 0 |
| 715.32704469 | 0.001 |
| 715.45425665 | 0 |
| 715.58147993 | 0 |
| 715.70871451 | 0 |
| 715.83596042 | 0 |
| 715.96321765 | 0 |
| 716.09048621 | 0 |
| 716.2177661 | 0 |
| 716.34505732 | 0 |
| 716.47235989 | 0 |
| 716.5996738 | 0.001 |
| 716.72699906 | 0 |
| 716.85433567 | 0.001 |
| 716.98168365 | 0 |
| 717.10904298 | 0 |
| 717.23641369 | 0 |
| 717.36379576 | 0.001 |
| 717.49118921 | 0 |
| 717.61859404 | 0 |
| 717.74601026 | 0 |
| 717.87343787 | 0.001 |
| 718.00087687 | 0 |
| 718.12832727 | 0 |
| 718.25578907 | 0 |
| 718.38326227 | 0 |
| 718.51074689 | 0 |
| 718.63824293 | 0 |
| 718.76575039 | 0 |
| 718.89326927 | 0 |
| 719.02079958 | 0 |
| 719.14834132 | 0 |
| 719.2758945 | 0 |
| 719.40345913 | 0.001 |
| 719.5310352 | 0 |
| 719.65862272 | 0.001 |
| 719.7862217 | 0 |
| 719.91383214 | 0 |
| 720.04145405 | 0 |
| 720.16908742 | 0.001 |
| 720.29673226 | 0 |
| 720.42438859 | 0.001 |
| 720.5520564 | 0 |
| 720.67973569 | 0 |
| 720.80742647 | 0 |
| 720.93512875 | 0 |
| 721.06284254 | 0 |
| 721.19056782 | 0 |
| 721.31830461 | 0 |
| 721.44605292 | 0 |
| 721.57381275 | 0 |
| 721.70158409 | 0 |
| 721.82936697 | 0 |
| 721.95716137 | 0 |
| 722.08496731 | 0 |
| 722.2127848 | 0 |
| 722.34061382 | 0 |
| 722.46845439 | 0 |
| 722.59630652 | 0 |
| 722.72417021 | 0.001 |
| 722.85204545 | 0 |
| 722.97993227 | 0 |
| 723.10783065 | 0 |
| 723.23574061 | 0 |
| 723.36366215 | 0 |
| 723.49159527 | 0 |
| 723.61953998 | 0 |
| 723.74749629 | 0 |
| 723.87546419 | 0 |
| 724.00344369 | 0 |
| 724.13143481 | 0 |
| 724.25943753 | 0 |
| 724.38745186 | 0 |
| 724.51547782 | 0.001 |
| 724.6435154 | 0 |
| 724.77156461 | 0 |
| 724.89962545 | 0 |
| 725.02769793 | 0 |
| 725.15578205 | 0 |
| 725.28387782 | 0 |
| 725.41198523 | 0 |
| 725.54010431 | 0 |
| 725.66823504 | 0 |
| 725.79637743 | 0.001 |
| 725.9245315 | 0 |
| 726.05269723 | 0.001 |
| 726.18087465 | 0 |
| 726.30906374 | 0 |
| 726.43726452 | 0 |
| 726.565477 | 0 |
| 726.69370116 | 0 |
| 726.82193703 | 0 |
| 726.9501846 | 0 |
| 727.07844387 | 0 |
| 727.20671486 | 0 |
| 727.33499757 | 0 |
| 727.463292 | 0 |
| 727.59159815 | 0.001 |
| 727.71991604 | 0 |
| 727.84824566 | 0 |
| 727.97658702 | 0 |
| 728.10494012 | 0 |
| 728.23330497 | 0 |
| 728.36168157 | 0 |
| 728.49006993 | 0 |
| 728.61847005 | 0 |
| 728.74688194 | 0 |
| 728.87530559 | 0 |
| 729.00374102 | 0 |
| 729.13218823 | 0 |
| 729.26064723 | 0 |
| 729.38911801 | 0 |
| 729.51760058 | 0 |
| 729.64609495 | 0.001 |
| 729.77460112 | 0 |
| 729.9031191 | 0 |
| 730.03164888 | 0 |
| 730.16019048 | 0.001 |
| 730.2887439 | 0 |
| 730.41730914 | 0 |
| 730.54588621 | 0 |
| 730.67447512 | 0 |
| 730.80307586 | 0 |
| 730.93168843 | 0 |
| 731.06031286 | 0 |
| 731.18894913 | 0 |
| 731.31759726 | 0 |
| 731.44625725 | 0 |
| 731.5749291 | 0 |
| 731.70361282 | 0 |
| 731.83230841 | 0 |
| 731.96101587 | 0 |
| 732.08973522 | 0 |
| 732.21846645 | 0 |
| 732.34720958 | 0 |
| 732.47596459 | 0 |
| 732.60473151 | 0 |
| 732.73351032 | 0 |
| 732.86230105 | 0 |
| 732.99110368 | 0.001 |
| 733.11991823 | 0 |
| 733.24874471 | 0.001 |
| 733.37758311 | 0 |
| 733.50643343 | 0.001 |
| 733.63529569 | 0 |
| 733.76416989 | 0.001 |
| 733.89305604 | 0 |
| 734.02195412 | 0 |
| 734.15086417 | 0 |
| 734.27978616 | 0 |
| 734.40872012 | 0 |
| 734.53766604 | 0.001 |
| 734.66662393 | 0 |
| 734.7955938 | 0 |
| 734.92457564 | 0 |
| 735.05356947 | 0 |
| 735.18257528 | 0 |
| 735.31159308 | 0 |
| 735.44062288 | 0 |
| 735.56966468 | 0 |
| 735.69871849 | 0 |
| 735.8277843 | 0 |
| 735.95686213 | 0 |
| 736.08595197 | 0.001 |
| 736.21505384 | 0 |
| 736.34416774 | 0 |
| 736.47329366 | 0 |
| 736.60243162 | 0 |
| 736.73158163 | 0 |
| 736.86074367 | 0 |
| 736.98991777 | 0 |
| 737.11910392 | 0 |
| 737.24830212 | 0 |
| 737.37751239 | 0 |
| 737.50673473 | 0 |
| 737.63596913 | 0 |
| 737.76521561 | 0 |
| 737.89447418 | 0 |
| 738.02374482 | 0 |
| 738.15302756 | 0.001 |
| 738.28232238 | 0 |
| 738.41162931 | 0 |
| 738.54094834 | 0 |
| 738.67027947 | 0 |
| 738.79962272 | 0 |
| 738.92897808 | 0 |
| 739.05834556 | 0 |
| 739.18772516 | 0 |
| 739.31711689 | 0 |
| 739.44652076 | 0 |
| 739.57593676 | 0 |
| 739.70536491 | 0 |
| 739.8348052 | 0 |
| 739.96425764 | 0 |
| 740.09372224 | 0 |
| 740.223199 | 0 |
| 740.35268792 | 0 |
| 740.48218901 | 0 |
| 740.61170227 | 0 |
| 740.74122771 | 0 |
| 740.87076533 | 0 |
| 741.00031514 | 0 |
| 741.12987714 | 0 |
| 741.25945133 | 0 |
| 741.38903773 | 0 |
| 741.51863632 | 0 |
| 741.64824713 | 0 |
| 741.77787015 | 0 |
| 741.90750538 | 0 |
| 742.03715284 | 0.001 |
| 742.16681252 | 0 |
| 742.29648443 | 0.001 |
| 742.42616858 | 0 |
| 742.55586497 | 0 |
| 742.6855736 | 0 |
| 742.81529448 | 0.001 |
| 742.94502761 | 0 |
| 743.074773 | 0.001 |
| 743.20453064 | 0 |
| 743.33430056 | 0 |
| 743.46408275 | 0 |
| 743.59387721 | 0 |
| 743.72368395 | 0 |
| 743.85350297 | 0 |
| 743.98333428 | 0 |
| 744.11317788 | 0 |
| 744.24303378 | 0 |
| 744.37290199 | 0 |
| 744.50278249 | 0 |
| 744.63267531 | 0.001 |
| 744.76258044 | 0 |
| 744.89249789 | 0.001 |
| 745.02242767 | 0 |
| 745.15236977 | 0 |
| 745.2823242 | 0 |
| 745.41229097 | 0 |
| 745.54227008 | 0 |
| 745.67226154 | 0.001 |
| 745.80226535 | 0 |
| 745.93228151 | 0.001 |
| 746.06231003 | 0 |
| 746.19235091 | 0 |
| 746.32240417 | 0 |
| 746.45246979 | 0.001 |
| 746.58254779 | 0 |
| 746.71263817 | 0.001 |
| 746.84274094 | 0 |
| 746.97285609 | 0 |